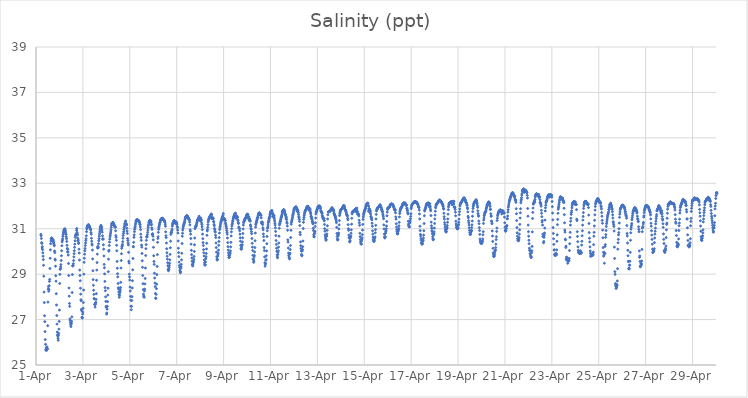
| Category | Salinity (ppt) |
|---|---|
| 44287.208333333336 | 30.75 |
| 44287.21875 | 30.69 |
| 44287.229166666664 | 30.57 |
| 44287.239583333336 | 30.39 |
| 44287.25 | 30.35 |
| 44287.260416666664 | 30.15 |
| 44287.270833333336 | 30.21 |
| 44287.28125 | 30.08 |
| 44287.291666666664 | 29.94 |
| 44287.302083333336 | 29.79 |
| 44287.3125 | 29.64 |
| 44287.322916666664 | 29.39 |
| 44287.333333333336 | 28.91 |
| 44287.34375 | 28.21 |
| 44287.354166666664 | 27.75 |
| 44287.364583333336 | 27.17 |
| 44287.375 | 26.91 |
| 44287.385416666664 | 26.47 |
| 44287.395833333336 | 26.12 |
| 44287.40625 | 25.91 |
| 44287.416666666664 | 25.66 |
| 44287.427083333336 | 25.69 |
| 44287.4375 | 25.76 |
| 44287.447916666664 | 25.64 |
| 44287.458333333336 | 25.72 |
| 44287.46875 | 25.8 |
| 44287.479166666664 | 25.7 |
| 44287.489583333336 | 25.71 |
| 44287.5 | 26.73 |
| 44287.510416666664 | 27.77 |
| 44287.520833333336 | 28.34 |
| 44287.53125 | 28.45 |
| 44287.541666666664 | 28.25 |
| 44287.552083333336 | 28.33 |
| 44287.5625 | 28.49 |
| 44287.572916666664 | 28.68 |
| 44287.583333333336 | 28.77 |
| 44287.59375 | 29.25 |
| 44287.604166666664 | 29.7 |
| 44287.614583333336 | 30.07 |
| 44287.625 | 30.34 |
| 44287.635416666664 | 30.46 |
| 44287.645833333336 | 30.55 |
| 44287.65625 | 30.58 |
| 44287.666666666664 | 30.59 |
| 44287.677083333336 | 30.58 |
| 44287.6875 | 30.56 |
| 44287.697916666664 | 30.54 |
| 44287.708333333336 | 30.44 |
| 44287.71875 | 30.51 |
| 44287.729166666664 | 30.51 |
| 44287.739583333336 | 30.46 |
| 44287.75 | 30.42 |
| 44287.760416666664 | 30.36 |
| 44287.770833333336 | 30.29 |
| 44287.78125 | 30.25 |
| 44287.791666666664 | 30.02 |
| 44287.802083333336 | 29.95 |
| 44287.8125 | 29.66 |
| 44287.822916666664 | 29.62 |
| 44287.833333333336 | 29.35 |
| 44287.84375 | 28.93 |
| 44287.854166666664 | 28.69 |
| 44287.864583333336 | 28.14 |
| 44287.875 | 27.64 |
| 44287.885416666664 | 27.18 |
| 44287.895833333336 | 26.8 |
| 44287.90625 | 26.45 |
| 44287.916666666664 | 26.32 |
| 44287.927083333336 | 26.28 |
| 44287.9375 | 26.18 |
| 44287.947916666664 | 26.09 |
| 44287.958333333336 | 26.3 |
| 44287.96875 | 26.39 |
| 44287.979166666664 | 26.58 |
| 44287.989583333336 | 26.92 |
| 44288.0 | 27.42 |
| 44288.010416666664 | 28.59 |
| 44288.020833333336 | 28.99 |
| 44288.03125 | 29.21 |
| 44288.041666666664 | 29.24 |
| 44288.052083333336 | 29.32 |
| 44288.0625 | 29.42 |
| 44288.072916666664 | 29.6 |
| 44288.083333333336 | 29.81 |
| 44288.09375 | 30.03 |
| 44288.104166666664 | 30.25 |
| 44288.114583333336 | 30.42 |
| 44288.125 | 30.49 |
| 44288.135416666664 | 30.55 |
| 44288.145833333336 | 30.66 |
| 44288.15625 | 30.73 |
| 44288.166666666664 | 30.81 |
| 44288.177083333336 | 30.86 |
| 44288.1875 | 30.92 |
| 44288.197916666664 | 30.94 |
| 44288.208333333336 | 30.97 |
| 44288.21875 | 30.97 |
| 44288.229166666664 | 31 |
| 44288.239583333336 | 30.9 |
| 44288.25 | 30.94 |
| 44288.260416666664 | 30.85 |
| 44288.270833333336 | 30.77 |
| 44288.28125 | 30.75 |
| 44288.291666666664 | 30.64 |
| 44288.302083333336 | 30.56 |
| 44288.3125 | 30.44 |
| 44288.322916666664 | 30.27 |
| 44288.333333333336 | 30.13 |
| 44288.34375 | 29.99 |
| 44288.354166666664 | 30.09 |
| 44288.364583333336 | 29.97 |
| 44288.375 | 29.84 |
| 44288.385416666664 | 29.47 |
| 44288.395833333336 | 28.94 |
| 44288.40625 | 28.39 |
| 44288.416666666664 | 28.03 |
| 44288.427083333336 | 27.71 |
| 44288.4375 | 27.58 |
| 44288.447916666664 | 27.03 |
| 44288.458333333336 | 26.96 |
| 44288.46875 | 26.87 |
| 44288.479166666664 | 26.77 |
| 44288.489583333336 | 26.69 |
| 44288.5 | 26.84 |
| 44288.510416666664 | 26.82 |
| 44288.520833333336 | 26.92 |
| 44288.53125 | 27.12 |
| 44288.541666666664 | 28.19 |
| 44288.552083333336 | 28.98 |
| 44288.5625 | 29.36 |
| 44288.572916666664 | 29.38 |
| 44288.583333333336 | 29.37 |
| 44288.59375 | 29.46 |
| 44288.604166666664 | 29.6 |
| 44288.614583333336 | 29.76 |
| 44288.625 | 29.9 |
| 44288.635416666664 | 30.03 |
| 44288.645833333336 | 30.18 |
| 44288.65625 | 30.32 |
| 44288.666666666664 | 30.47 |
| 44288.677083333336 | 30.62 |
| 44288.6875 | 30.69 |
| 44288.697916666664 | 30.73 |
| 44288.708333333336 | 30.75 |
| 44288.71875 | 30.78 |
| 44288.729166666664 | 30.93 |
| 44288.739583333336 | 31.01 |
| 44288.75 | 30.84 |
| 44288.760416666664 | 30.79 |
| 44288.770833333336 | 30.72 |
| 44288.78125 | 30.58 |
| 44288.791666666664 | 30.46 |
| 44288.802083333336 | 30.5 |
| 44288.8125 | 30.35 |
| 44288.822916666664 | 30.37 |
| 44288.833333333336 | 30.1 |
| 44288.84375 | 29.93 |
| 44288.854166666664 | 29.62 |
| 44288.864583333336 | 29.18 |
| 44288.875 | 28.94 |
| 44288.885416666664 | 28.71 |
| 44288.895833333336 | 28.38 |
| 44288.90625 | 28.12 |
| 44288.916666666664 | 27.87 |
| 44288.927083333336 | 27.83 |
| 44288.9375 | 27.45 |
| 44288.947916666664 | 27.39 |
| 44288.958333333336 | 27.1 |
| 44288.96875 | 27.07 |
| 44288.979166666664 | 27.08 |
| 44288.989583333336 | 27.24 |
| 44289.0 | 27.33 |
| 44289.010416666664 | 27.5 |
| 44289.020833333336 | 27.75 |
| 44289.03125 | 28.3 |
| 44289.041666666664 | 29 |
| 44289.052083333336 | 29.52 |
| 44289.0625 | 29.7 |
| 44289.072916666664 | 29.88 |
| 44289.083333333336 | 30.03 |
| 44289.09375 | 30.13 |
| 44289.104166666664 | 30.26 |
| 44289.114583333336 | 30.37 |
| 44289.125 | 30.48 |
| 44289.135416666664 | 30.56 |
| 44289.145833333336 | 30.69 |
| 44289.15625 | 30.87 |
| 44289.166666666664 | 30.99 |
| 44289.177083333336 | 31.05 |
| 44289.1875 | 31.1 |
| 44289.197916666664 | 31.13 |
| 44289.208333333336 | 31.15 |
| 44289.21875 | 31.15 |
| 44289.229166666664 | 31.17 |
| 44289.239583333336 | 31.18 |
| 44289.25 | 31.15 |
| 44289.260416666664 | 31.08 |
| 44289.270833333336 | 31.13 |
| 44289.28125 | 31.1 |
| 44289.291666666664 | 31.07 |
| 44289.302083333336 | 31.03 |
| 44289.3125 | 30.98 |
| 44289.322916666664 | 31 |
| 44289.333333333336 | 30.95 |
| 44289.34375 | 30.83 |
| 44289.354166666664 | 30.76 |
| 44289.364583333336 | 30.58 |
| 44289.375 | 30.45 |
| 44289.385416666664 | 30.33 |
| 44289.395833333336 | 30.28 |
| 44289.40625 | 30.06 |
| 44289.416666666664 | 29.67 |
| 44289.427083333336 | 29.15 |
| 44289.4375 | 28.76 |
| 44289.447916666664 | 28.51 |
| 44289.458333333336 | 28.29 |
| 44289.46875 | 28.11 |
| 44289.479166666664 | 27.93 |
| 44289.489583333336 | 27.91 |
| 44289.5 | 27.67 |
| 44289.510416666664 | 27.67 |
| 44289.520833333336 | 27.55 |
| 44289.53125 | 27.67 |
| 44289.541666666664 | 27.73 |
| 44289.552083333336 | 27.76 |
| 44289.5625 | 27.89 |
| 44289.572916666664 | 28.14 |
| 44289.583333333336 | 28.73 |
| 44289.59375 | 29.18 |
| 44289.604166666664 | 29.51 |
| 44289.614583333336 | 29.88 |
| 44289.625 | 30.16 |
| 44289.635416666664 | 30.22 |
| 44289.645833333336 | 30.15 |
| 44289.65625 | 30.19 |
| 44289.666666666664 | 30.34 |
| 44289.677083333336 | 30.47 |
| 44289.6875 | 30.56 |
| 44289.697916666664 | 30.67 |
| 44289.708333333336 | 30.77 |
| 44289.71875 | 30.86 |
| 44289.729166666664 | 30.95 |
| 44289.739583333336 | 31.04 |
| 44289.75 | 31.08 |
| 44289.760416666664 | 31.09 |
| 44289.770833333336 | 31.15 |
| 44289.78125 | 31.05 |
| 44289.791666666664 | 31.04 |
| 44289.802083333336 | 31.08 |
| 44289.8125 | 30.95 |
| 44289.822916666664 | 30.85 |
| 44289.833333333336 | 30.69 |
| 44289.84375 | 30.54 |
| 44289.854166666664 | 30.56 |
| 44289.864583333336 | 30.54 |
| 44289.875 | 30.29 |
| 44289.885416666664 | 30.1 |
| 44289.895833333336 | 29.8 |
| 44289.90625 | 29.43 |
| 44289.916666666664 | 29.28 |
| 44289.927083333336 | 29.01 |
| 44289.9375 | 28.68 |
| 44289.947916666664 | 28.41 |
| 44289.958333333336 | 28.27 |
| 44289.96875 | 28 |
| 44289.979166666664 | 27.8 |
| 44289.989583333336 | 27.58 |
| 44290.0 | 27.54 |
| 44290.010416666664 | 27.24 |
| 44290.020833333336 | 27.29 |
| 44290.03125 | 27.46 |
| 44290.041666666664 | 27.58 |
| 44290.052083333336 | 27.79 |
| 44290.0625 | 28.08 |
| 44290.072916666664 | 28.38 |
| 44290.083333333336 | 29.11 |
| 44290.09375 | 29.66 |
| 44290.104166666664 | 30.01 |
| 44290.114583333336 | 30.05 |
| 44290.125 | 30.26 |
| 44290.135416666664 | 30.41 |
| 44290.145833333336 | 30.54 |
| 44290.15625 | 30.64 |
| 44290.166666666664 | 30.71 |
| 44290.177083333336 | 30.79 |
| 44290.1875 | 30.86 |
| 44290.197916666664 | 30.95 |
| 44290.208333333336 | 31.06 |
| 44290.21875 | 31.15 |
| 44290.229166666664 | 31.21 |
| 44290.239583333336 | 31.24 |
| 44290.25 | 31.25 |
| 44290.260416666664 | 31.26 |
| 44290.270833333336 | 31.26 |
| 44290.28125 | 31.27 |
| 44290.291666666664 | 31.27 |
| 44290.302083333336 | 31.21 |
| 44290.3125 | 31.19 |
| 44290.322916666664 | 31.18 |
| 44290.333333333336 | 31.16 |
| 44290.34375 | 31.11 |
| 44290.354166666664 | 31.1 |
| 44290.364583333336 | 31.08 |
| 44290.375 | 31.09 |
| 44290.385416666664 | 31.06 |
| 44290.395833333336 | 30.91 |
| 44290.40625 | 30.7 |
| 44290.416666666664 | 30.62 |
| 44290.427083333336 | 30.49 |
| 44290.4375 | 30.27 |
| 44290.447916666664 | 30.03 |
| 44290.458333333336 | 29.56 |
| 44290.46875 | 29.26 |
| 44290.479166666664 | 29.02 |
| 44290.489583333336 | 28.88 |
| 44290.5 | 28.59 |
| 44290.510416666664 | 28.4 |
| 44290.520833333336 | 28.35 |
| 44290.53125 | 28.22 |
| 44290.541666666664 | 28.1 |
| 44290.552083333336 | 27.98 |
| 44290.5625 | 28.06 |
| 44290.572916666664 | 28.18 |
| 44290.583333333336 | 28.24 |
| 44290.59375 | 28.31 |
| 44290.604166666664 | 28.41 |
| 44290.614583333336 | 28.64 |
| 44290.625 | 29.27 |
| 44290.635416666664 | 29.6 |
| 44290.645833333336 | 29.9 |
| 44290.65625 | 30.14 |
| 44290.666666666664 | 30.22 |
| 44290.677083333336 | 30.25 |
| 44290.6875 | 30.31 |
| 44290.697916666664 | 30.43 |
| 44290.708333333336 | 30.58 |
| 44290.71875 | 30.7 |
| 44290.729166666664 | 30.79 |
| 44290.739583333336 | 30.87 |
| 44290.75 | 30.96 |
| 44290.760416666664 | 31.05 |
| 44290.770833333336 | 31.09 |
| 44290.78125 | 31.16 |
| 44290.791666666664 | 31.22 |
| 44290.802083333336 | 31.24 |
| 44290.8125 | 31.31 |
| 44290.822916666664 | 31.34 |
| 44290.833333333336 | 31.22 |
| 44290.84375 | 31.2 |
| 44290.854166666664 | 31.2 |
| 44290.864583333336 | 31.16 |
| 44290.875 | 31.02 |
| 44290.885416666664 | 30.9 |
| 44290.895833333336 | 30.79 |
| 44290.90625 | 30.57 |
| 44290.916666666664 | 30.48 |
| 44290.927083333336 | 30.37 |
| 44290.9375 | 30.29 |
| 44290.947916666664 | 29.96 |
| 44290.958333333336 | 29.57 |
| 44290.96875 | 29.49 |
| 44290.979166666664 | 29 |
| 44290.989583333336 | 28.88 |
| 44291.0 | 28.74 |
| 44291.010416666664 | 28.43 |
| 44291.020833333336 | 28.26 |
| 44291.03125 | 28.02 |
| 44291.041666666664 | 27.85 |
| 44291.052083333336 | 27.59 |
| 44291.0625 | 27.43 |
| 44291.072916666664 | 27.58 |
| 44291.083333333336 | 27.84 |
| 44291.09375 | 28.01 |
| 44291.104166666664 | 28.39 |
| 44291.114583333336 | 28.71 |
| 44291.125 | 29.19 |
| 44291.135416666664 | 29.69 |
| 44291.145833333336 | 30.21 |
| 44291.15625 | 30.21 |
| 44291.166666666664 | 30.4 |
| 44291.177083333336 | 30.62 |
| 44291.1875 | 30.73 |
| 44291.197916666664 | 30.87 |
| 44291.208333333336 | 30.97 |
| 44291.21875 | 31.04 |
| 44291.229166666664 | 31.09 |
| 44291.239583333336 | 31.17 |
| 44291.25 | 31.24 |
| 44291.260416666664 | 31.3 |
| 44291.270833333336 | 31.35 |
| 44291.28125 | 31.37 |
| 44291.291666666664 | 31.38 |
| 44291.302083333336 | 31.39 |
| 44291.3125 | 31.39 |
| 44291.322916666664 | 31.4 |
| 44291.333333333336 | 31.37 |
| 44291.34375 | 31.35 |
| 44291.354166666664 | 31.34 |
| 44291.364583333336 | 31.37 |
| 44291.375 | 31.35 |
| 44291.385416666664 | 31.34 |
| 44291.395833333336 | 31.32 |
| 44291.40625 | 31.3 |
| 44291.416666666664 | 31.26 |
| 44291.427083333336 | 31.2 |
| 44291.4375 | 31.18 |
| 44291.447916666664 | 31.08 |
| 44291.458333333336 | 30.96 |
| 44291.46875 | 30.76 |
| 44291.479166666664 | 30.62 |
| 44291.489583333336 | 30.49 |
| 44291.5 | 30.28 |
| 44291.510416666664 | 30.19 |
| 44291.520833333336 | 29.91 |
| 44291.53125 | 29.59 |
| 44291.541666666664 | 29.3 |
| 44291.552083333336 | 28.94 |
| 44291.5625 | 28.58 |
| 44291.572916666664 | 28.32 |
| 44291.583333333336 | 28.12 |
| 44291.59375 | 28.04 |
| 44291.604166666664 | 27.99 |
| 44291.614583333336 | 27.99 |
| 44291.625 | 28.26 |
| 44291.635416666664 | 28.34 |
| 44291.645833333336 | 28.57 |
| 44291.65625 | 28.81 |
| 44291.666666666664 | 29.27 |
| 44291.677083333336 | 29.82 |
| 44291.6875 | 30.12 |
| 44291.697916666664 | 30.3 |
| 44291.708333333336 | 30.49 |
| 44291.71875 | 30.64 |
| 44291.729166666664 | 30.63 |
| 44291.739583333336 | 30.66 |
| 44291.75 | 30.74 |
| 44291.760416666664 | 30.84 |
| 44291.770833333336 | 30.94 |
| 44291.78125 | 31.05 |
| 44291.791666666664 | 31.13 |
| 44291.802083333336 | 31.19 |
| 44291.8125 | 31.26 |
| 44291.822916666664 | 31.29 |
| 44291.833333333336 | 31.32 |
| 44291.84375 | 31.32 |
| 44291.854166666664 | 31.37 |
| 44291.864583333336 | 31.37 |
| 44291.875 | 31.36 |
| 44291.885416666664 | 31.3 |
| 44291.895833333336 | 31.3 |
| 44291.90625 | 31.31 |
| 44291.916666666664 | 31.17 |
| 44291.927083333336 | 31.2 |
| 44291.9375 | 31.04 |
| 44291.947916666664 | 30.97 |
| 44291.958333333336 | 30.74 |
| 44291.96875 | 30.78 |
| 44291.979166666664 | 30.77 |
| 44291.989583333336 | 30.67 |
| 44292.0 | 30.51 |
| 44292.010416666664 | 30.18 |
| 44292.020833333336 | 29.81 |
| 44292.03125 | 29.56 |
| 44292.041666666664 | 29.43 |
| 44292.052083333336 | 29.04 |
| 44292.0625 | 28.83 |
| 44292.072916666664 | 28.61 |
| 44292.083333333336 | 28.45 |
| 44292.09375 | 28.15 |
| 44292.104166666664 | 27.95 |
| 44292.114583333336 | 27.93 |
| 44292.125 | 28.11 |
| 44292.135416666664 | 28.36 |
| 44292.145833333336 | 28.56 |
| 44292.15625 | 28.98 |
| 44292.166666666664 | 29.34 |
| 44292.177083333336 | 29.86 |
| 44292.1875 | 30.4 |
| 44292.197916666664 | 30.57 |
| 44292.208333333336 | 30.65 |
| 44292.21875 | 30.84 |
| 44292.229166666664 | 30.97 |
| 44292.239583333336 | 31.05 |
| 44292.25 | 31.11 |
| 44292.260416666664 | 31.16 |
| 44292.270833333336 | 31.21 |
| 44292.28125 | 31.26 |
| 44292.291666666664 | 31.29 |
| 44292.302083333336 | 31.34 |
| 44292.3125 | 31.37 |
| 44292.322916666664 | 31.4 |
| 44292.333333333336 | 31.42 |
| 44292.34375 | 31.44 |
| 44292.354166666664 | 31.44 |
| 44292.364583333336 | 31.45 |
| 44292.375 | 31.46 |
| 44292.385416666664 | 31.46 |
| 44292.395833333336 | 31.46 |
| 44292.40625 | 31.44 |
| 44292.416666666664 | 31.4 |
| 44292.427083333336 | 31.41 |
| 44292.4375 | 31.4 |
| 44292.447916666664 | 31.37 |
| 44292.458333333336 | 31.38 |
| 44292.46875 | 31.37 |
| 44292.479166666664 | 31.32 |
| 44292.489583333336 | 31.34 |
| 44292.5 | 31.28 |
| 44292.510416666664 | 31.2 |
| 44292.520833333336 | 31.11 |
| 44292.53125 | 30.86 |
| 44292.541666666664 | 30.69 |
| 44292.552083333336 | 30.61 |
| 44292.5625 | 30.37 |
| 44292.572916666664 | 30.12 |
| 44292.583333333336 | 29.94 |
| 44292.59375 | 29.79 |
| 44292.604166666664 | 29.66 |
| 44292.614583333336 | 29.5 |
| 44292.625 | 29.37 |
| 44292.635416666664 | 29.21 |
| 44292.645833333336 | 29.15 |
| 44292.65625 | 29.18 |
| 44292.666666666664 | 29.2 |
| 44292.677083333336 | 29.29 |
| 44292.6875 | 29.38 |
| 44292.697916666664 | 29.48 |
| 44292.708333333336 | 29.63 |
| 44292.71875 | 29.87 |
| 44292.729166666664 | 30.16 |
| 44292.739583333336 | 30.45 |
| 44292.75 | 30.75 |
| 44292.760416666664 | 30.84 |
| 44292.770833333336 | 30.83 |
| 44292.78125 | 30.83 |
| 44292.791666666664 | 30.91 |
| 44292.802083333336 | 30.98 |
| 44292.8125 | 31.11 |
| 44292.822916666664 | 31.18 |
| 44292.833333333336 | 31.23 |
| 44292.84375 | 31.27 |
| 44292.854166666664 | 31.29 |
| 44292.864583333336 | 31.31 |
| 44292.875 | 31.33 |
| 44292.885416666664 | 31.35 |
| 44292.895833333336 | 31.36 |
| 44292.90625 | 31.35 |
| 44292.916666666664 | 31.31 |
| 44292.927083333336 | 31.3 |
| 44292.9375 | 31.24 |
| 44292.947916666664 | 31.25 |
| 44292.958333333336 | 31.23 |
| 44292.96875 | 31.31 |
| 44292.979166666664 | 31.24 |
| 44292.989583333336 | 31.27 |
| 44293.0 | 31.26 |
| 44293.010416666664 | 31.2 |
| 44293.020833333336 | 31.1 |
| 44293.03125 | 31.05 |
| 44293.041666666664 | 30.94 |
| 44293.052083333336 | 30.81 |
| 44293.0625 | 30.46 |
| 44293.072916666664 | 30.14 |
| 44293.083333333336 | 29.95 |
| 44293.09375 | 29.77 |
| 44293.104166666664 | 29.53 |
| 44293.114583333336 | 29.38 |
| 44293.125 | 29.3 |
| 44293.135416666664 | 29.18 |
| 44293.145833333336 | 29.13 |
| 44293.15625 | 29.06 |
| 44293.166666666664 | 29.1 |
| 44293.177083333336 | 29.26 |
| 44293.1875 | 29.32 |
| 44293.197916666664 | 29.43 |
| 44293.208333333336 | 29.63 |
| 44293.21875 | 29.92 |
| 44293.229166666664 | 30.35 |
| 44293.239583333336 | 30.67 |
| 44293.25 | 30.8 |
| 44293.260416666664 | 30.94 |
| 44293.270833333336 | 31.02 |
| 44293.28125 | 31.09 |
| 44293.291666666664 | 31.14 |
| 44293.302083333336 | 31.18 |
| 44293.3125 | 31.22 |
| 44293.322916666664 | 31.25 |
| 44293.333333333336 | 31.29 |
| 44293.34375 | 31.34 |
| 44293.354166666664 | 31.39 |
| 44293.364583333336 | 31.45 |
| 44293.375 | 31.49 |
| 44293.385416666664 | 31.52 |
| 44293.395833333336 | 31.54 |
| 44293.40625 | 31.55 |
| 44293.416666666664 | 31.56 |
| 44293.427083333336 | 31.57 |
| 44293.4375 | 31.57 |
| 44293.447916666664 | 31.57 |
| 44293.458333333336 | 31.53 |
| 44293.46875 | 31.53 |
| 44293.479166666664 | 31.48 |
| 44293.489583333336 | 31.49 |
| 44293.5 | 31.49 |
| 44293.510416666664 | 31.45 |
| 44293.520833333336 | 31.4 |
| 44293.53125 | 31.41 |
| 44293.541666666664 | 31.38 |
| 44293.552083333336 | 31.29 |
| 44293.5625 | 31.17 |
| 44293.572916666664 | 30.95 |
| 44293.583333333336 | 30.89 |
| 44293.59375 | 30.76 |
| 44293.604166666664 | 30.57 |
| 44293.614583333336 | 30.32 |
| 44293.625 | 30.05 |
| 44293.635416666664 | 29.86 |
| 44293.645833333336 | 29.71 |
| 44293.65625 | 29.57 |
| 44293.666666666664 | 29.43 |
| 44293.677083333336 | 29.38 |
| 44293.6875 | 29.36 |
| 44293.697916666664 | 29.45 |
| 44293.708333333336 | 29.52 |
| 44293.71875 | 29.58 |
| 44293.729166666664 | 29.66 |
| 44293.739583333336 | 29.78 |
| 44293.75 | 30 |
| 44293.760416666664 | 30.29 |
| 44293.770833333336 | 30.59 |
| 44293.78125 | 31 |
| 44293.791666666664 | 31.08 |
| 44293.802083333336 | 31.1 |
| 44293.8125 | 31.09 |
| 44293.822916666664 | 31.1 |
| 44293.833333333336 | 31.14 |
| 44293.84375 | 31.18 |
| 44293.854166666664 | 31.24 |
| 44293.864583333336 | 31.28 |
| 44293.875 | 31.33 |
| 44293.885416666664 | 31.37 |
| 44293.895833333336 | 31.4 |
| 44293.90625 | 31.41 |
| 44293.916666666664 | 31.43 |
| 44293.927083333336 | 31.46 |
| 44293.9375 | 31.47 |
| 44293.947916666664 | 31.49 |
| 44293.958333333336 | 31.55 |
| 44293.96875 | 31.48 |
| 44293.979166666664 | 31.43 |
| 44293.989583333336 | 31.37 |
| 44294.0 | 31.39 |
| 44294.010416666664 | 31.36 |
| 44294.020833333336 | 31.43 |
| 44294.03125 | 31.47 |
| 44294.041666666664 | 31.4 |
| 44294.052083333336 | 31.37 |
| 44294.0625 | 31.26 |
| 44294.072916666664 | 31.18 |
| 44294.083333333336 | 31.08 |
| 44294.09375 | 30.96 |
| 44294.104166666664 | 30.76 |
| 44294.114583333336 | 30.56 |
| 44294.125 | 30.39 |
| 44294.135416666664 | 30.26 |
| 44294.145833333336 | 30.08 |
| 44294.15625 | 29.94 |
| 44294.166666666664 | 29.8 |
| 44294.177083333336 | 29.62 |
| 44294.1875 | 29.5 |
| 44294.197916666664 | 29.41 |
| 44294.208333333336 | 29.4 |
| 44294.21875 | 29.41 |
| 44294.229166666664 | 29.54 |
| 44294.239583333336 | 29.68 |
| 44294.25 | 29.77 |
| 44294.260416666664 | 29.91 |
| 44294.270833333336 | 30.11 |
| 44294.28125 | 30.36 |
| 44294.291666666664 | 30.71 |
| 44294.302083333336 | 30.9 |
| 44294.3125 | 30.96 |
| 44294.322916666664 | 31.06 |
| 44294.333333333336 | 31.18 |
| 44294.34375 | 31.3 |
| 44294.354166666664 | 31.36 |
| 44294.364583333336 | 31.41 |
| 44294.375 | 31.44 |
| 44294.385416666664 | 31.47 |
| 44294.395833333336 | 31.48 |
| 44294.40625 | 31.52 |
| 44294.416666666664 | 31.53 |
| 44294.427083333336 | 31.56 |
| 44294.4375 | 31.57 |
| 44294.447916666664 | 31.59 |
| 44294.458333333336 | 31.59 |
| 44294.46875 | 31.61 |
| 44294.479166666664 | 31.65 |
| 44294.489583333336 | 31.62 |
| 44294.5 | 31.45 |
| 44294.510416666664 | 31.44 |
| 44294.520833333336 | 31.45 |
| 44294.53125 | 31.49 |
| 44294.541666666664 | 31.48 |
| 44294.552083333336 | 31.44 |
| 44294.5625 | 31.45 |
| 44294.572916666664 | 31.32 |
| 44294.583333333336 | 31.3 |
| 44294.59375 | 31.19 |
| 44294.604166666664 | 31.13 |
| 44294.614583333336 | 31.01 |
| 44294.625 | 30.95 |
| 44294.635416666664 | 30.89 |
| 44294.645833333336 | 30.85 |
| 44294.65625 | 30.71 |
| 44294.666666666664 | 30.61 |
| 44294.677083333336 | 30.37 |
| 44294.6875 | 30.17 |
| 44294.697916666664 | 29.97 |
| 44294.708333333336 | 29.76 |
| 44294.71875 | 29.65 |
| 44294.729166666664 | 29.62 |
| 44294.739583333336 | 29.65 |
| 44294.75 | 29.79 |
| 44294.760416666664 | 29.85 |
| 44294.770833333336 | 29.93 |
| 44294.78125 | 30.06 |
| 44294.791666666664 | 30.27 |
| 44294.802083333336 | 30.44 |
| 44294.8125 | 30.61 |
| 44294.822916666664 | 30.81 |
| 44294.833333333336 | 30.96 |
| 44294.84375 | 31.04 |
| 44294.854166666664 | 31.11 |
| 44294.864583333336 | 31.17 |
| 44294.875 | 31.24 |
| 44294.885416666664 | 31.29 |
| 44294.895833333336 | 31.32 |
| 44294.90625 | 31.36 |
| 44294.916666666664 | 31.41 |
| 44294.927083333336 | 31.45 |
| 44294.9375 | 31.47 |
| 44294.947916666664 | 31.52 |
| 44294.958333333336 | 31.53 |
| 44294.96875 | 31.56 |
| 44294.979166666664 | 31.6 |
| 44294.989583333336 | 31.67 |
| 44295.0 | 31.46 |
| 44295.010416666664 | 31.4 |
| 44295.020833333336 | 31.41 |
| 44295.03125 | 31.42 |
| 44295.041666666664 | 31.44 |
| 44295.052083333336 | 31.42 |
| 44295.0625 | 31.36 |
| 44295.072916666664 | 31.36 |
| 44295.083333333336 | 31.25 |
| 44295.09375 | 31.2 |
| 44295.104166666664 | 31.12 |
| 44295.114583333336 | 31.09 |
| 44295.125 | 31.01 |
| 44295.135416666664 | 30.92 |
| 44295.145833333336 | 30.84 |
| 44295.15625 | 30.76 |
| 44295.166666666664 | 30.59 |
| 44295.177083333336 | 30.39 |
| 44295.1875 | 30.21 |
| 44295.197916666664 | 30.06 |
| 44295.208333333336 | 29.94 |
| 44295.21875 | 29.83 |
| 44295.229166666664 | 29.73 |
| 44295.239583333336 | 29.74 |
| 44295.25 | 29.75 |
| 44295.260416666664 | 29.84 |
| 44295.270833333336 | 29.89 |
| 44295.28125 | 29.93 |
| 44295.291666666664 | 30.02 |
| 44295.302083333336 | 30.2 |
| 44295.3125 | 30.4 |
| 44295.322916666664 | 30.68 |
| 44295.333333333336 | 30.86 |
| 44295.34375 | 31 |
| 44295.354166666664 | 31.12 |
| 44295.364583333336 | 31.18 |
| 44295.375 | 31.24 |
| 44295.385416666664 | 31.31 |
| 44295.395833333336 | 31.37 |
| 44295.40625 | 31.43 |
| 44295.416666666664 | 31.47 |
| 44295.427083333336 | 31.51 |
| 44295.4375 | 31.53 |
| 44295.447916666664 | 31.57 |
| 44295.458333333336 | 31.61 |
| 44295.46875 | 31.64 |
| 44295.479166666664 | 31.65 |
| 44295.489583333336 | 31.57 |
| 44295.5 | 31.62 |
| 44295.510416666664 | 31.69 |
| 44295.520833333336 | 31.55 |
| 44295.53125 | 31.46 |
| 44295.541666666664 | 31.48 |
| 44295.552083333336 | 31.54 |
| 44295.5625 | 31.56 |
| 44295.572916666664 | 31.54 |
| 44295.583333333336 | 31.51 |
| 44295.59375 | 31.5 |
| 44295.604166666664 | 31.39 |
| 44295.614583333336 | 31.36 |
| 44295.625 | 31.27 |
| 44295.635416666664 | 31.23 |
| 44295.645833333336 | 31.08 |
| 44295.65625 | 31.03 |
| 44295.666666666664 | 31.03 |
| 44295.677083333336 | 31 |
| 44295.6875 | 30.91 |
| 44295.697916666664 | 30.76 |
| 44295.708333333336 | 30.6 |
| 44295.71875 | 30.45 |
| 44295.729166666664 | 30.27 |
| 44295.739583333336 | 30.14 |
| 44295.75 | 30.1 |
| 44295.760416666664 | 30.1 |
| 44295.770833333336 | 30.19 |
| 44295.78125 | 30.27 |
| 44295.791666666664 | 30.3 |
| 44295.802083333336 | 30.42 |
| 44295.8125 | 30.6 |
| 44295.822916666664 | 30.79 |
| 44295.833333333336 | 30.99 |
| 44295.84375 | 31.16 |
| 44295.854166666664 | 31.26 |
| 44295.864583333336 | 31.31 |
| 44295.875 | 31.33 |
| 44295.885416666664 | 31.36 |
| 44295.895833333336 | 31.39 |
| 44295.90625 | 31.4 |
| 44295.916666666664 | 31.44 |
| 44295.927083333336 | 31.45 |
| 44295.9375 | 31.47 |
| 44295.947916666664 | 31.49 |
| 44295.958333333336 | 31.51 |
| 44295.96875 | 31.55 |
| 44295.979166666664 | 31.57 |
| 44295.989583333336 | 31.61 |
| 44296.0 | 31.63 |
| 44296.010416666664 | 31.64 |
| 44296.020833333336 | 31.63 |
| 44296.03125 | 31.63 |
| 44296.041666666664 | 31.54 |
| 44296.052083333336 | 31.46 |
| 44296.0625 | 31.54 |
| 44296.072916666664 | 31.44 |
| 44296.083333333336 | 31.51 |
| 44296.09375 | 31.38 |
| 44296.104166666664 | 31.37 |
| 44296.114583333336 | 31.42 |
| 44296.125 | 31.33 |
| 44296.135416666664 | 31.35 |
| 44296.145833333336 | 31.17 |
| 44296.15625 | 31.11 |
| 44296.166666666664 | 31.01 |
| 44296.177083333336 | 30.97 |
| 44296.1875 | 30.87 |
| 44296.197916666664 | 30.78 |
| 44296.208333333336 | 30.57 |
| 44296.21875 | 30.36 |
| 44296.229166666664 | 30.19 |
| 44296.239583333336 | 30.04 |
| 44296.25 | 29.83 |
| 44296.260416666664 | 29.67 |
| 44296.270833333336 | 29.64 |
| 44296.28125 | 29.52 |
| 44296.291666666664 | 29.57 |
| 44296.302083333336 | 29.76 |
| 44296.3125 | 29.82 |
| 44296.322916666664 | 29.98 |
| 44296.333333333336 | 30.17 |
| 44296.34375 | 30.47 |
| 44296.354166666664 | 30.81 |
| 44296.364583333336 | 31.07 |
| 44296.375 | 31.18 |
| 44296.385416666664 | 31.24 |
| 44296.395833333336 | 31.28 |
| 44296.40625 | 31.31 |
| 44296.416666666664 | 31.35 |
| 44296.427083333336 | 31.4 |
| 44296.4375 | 31.45 |
| 44296.447916666664 | 31.48 |
| 44296.458333333336 | 31.51 |
| 44296.46875 | 31.56 |
| 44296.479166666664 | 31.6 |
| 44296.489583333336 | 31.64 |
| 44296.5 | 31.67 |
| 44296.510416666664 | 31.69 |
| 44296.520833333336 | 31.7 |
| 44296.53125 | 31.69 |
| 44296.541666666664 | 31.67 |
| 44296.552083333336 | 31.64 |
| 44296.5625 | 31.62 |
| 44296.572916666664 | 31.61 |
| 44296.583333333336 | 31.62 |
| 44296.59375 | 31.59 |
| 44296.604166666664 | 31.48 |
| 44296.614583333336 | 31.29 |
| 44296.625 | 31.23 |
| 44296.635416666664 | 31.23 |
| 44296.645833333336 | 31.26 |
| 44296.65625 | 31.29 |
| 44296.666666666664 | 31.18 |
| 44296.677083333336 | 31.04 |
| 44296.6875 | 30.95 |
| 44296.697916666664 | 30.77 |
| 44296.708333333336 | 30.65 |
| 44296.71875 | 30.48 |
| 44296.729166666664 | 30.17 |
| 44296.739583333336 | 30.04 |
| 44296.75 | 29.76 |
| 44296.760416666664 | 29.5 |
| 44296.770833333336 | 29.35 |
| 44296.78125 | 29.44 |
| 44296.791666666664 | 29.47 |
| 44296.802083333336 | 29.61 |
| 44296.8125 | 29.64 |
| 44296.822916666664 | 29.81 |
| 44296.833333333336 | 30.02 |
| 44296.84375 | 30.34 |
| 44296.854166666664 | 30.66 |
| 44296.864583333336 | 30.91 |
| 44296.875 | 31.03 |
| 44296.885416666664 | 31.07 |
| 44296.895833333336 | 31.16 |
| 44296.90625 | 31.26 |
| 44296.916666666664 | 31.31 |
| 44296.927083333336 | 31.37 |
| 44296.9375 | 31.44 |
| 44296.947916666664 | 31.46 |
| 44296.958333333336 | 31.5 |
| 44296.96875 | 31.55 |
| 44296.979166666664 | 31.62 |
| 44296.989583333336 | 31.67 |
| 44297.0 | 31.71 |
| 44297.010416666664 | 31.75 |
| 44297.020833333336 | 31.76 |
| 44297.03125 | 31.78 |
| 44297.041666666664 | 31.77 |
| 44297.052083333336 | 31.78 |
| 44297.0625 | 31.8 |
| 44297.072916666664 | 31.73 |
| 44297.083333333336 | 31.65 |
| 44297.09375 | 31.53 |
| 44297.104166666664 | 31.66 |
| 44297.114583333336 | 31.59 |
| 44297.125 | 31.59 |
| 44297.135416666664 | 31.58 |
| 44297.145833333336 | 31.57 |
| 44297.15625 | 31.51 |
| 44297.166666666664 | 31.43 |
| 44297.177083333336 | 31.34 |
| 44297.1875 | 31.24 |
| 44297.197916666664 | 31.16 |
| 44297.208333333336 | 31.04 |
| 44297.21875 | 30.88 |
| 44297.229166666664 | 30.7 |
| 44297.239583333336 | 30.48 |
| 44297.25 | 30.31 |
| 44297.260416666664 | 30.14 |
| 44297.270833333336 | 30.01 |
| 44297.28125 | 29.85 |
| 44297.291666666664 | 29.76 |
| 44297.302083333336 | 29.72 |
| 44297.3125 | 29.86 |
| 44297.322916666664 | 29.96 |
| 44297.333333333336 | 30.03 |
| 44297.34375 | 30.19 |
| 44297.354166666664 | 30.37 |
| 44297.364583333336 | 30.67 |
| 44297.375 | 31.02 |
| 44297.385416666664 | 31.17 |
| 44297.395833333336 | 31.23 |
| 44297.40625 | 31.26 |
| 44297.416666666664 | 31.32 |
| 44297.427083333336 | 31.35 |
| 44297.4375 | 31.42 |
| 44297.447916666664 | 31.46 |
| 44297.458333333336 | 31.51 |
| 44297.46875 | 31.52 |
| 44297.479166666664 | 31.57 |
| 44297.489583333336 | 31.63 |
| 44297.5 | 31.7 |
| 44297.510416666664 | 31.75 |
| 44297.520833333336 | 31.78 |
| 44297.53125 | 31.8 |
| 44297.541666666664 | 31.82 |
| 44297.552083333336 | 31.82 |
| 44297.5625 | 31.83 |
| 44297.572916666664 | 31.84 |
| 44297.583333333336 | 31.77 |
| 44297.59375 | 31.79 |
| 44297.604166666664 | 31.73 |
| 44297.614583333336 | 31.67 |
| 44297.625 | 31.65 |
| 44297.635416666664 | 31.61 |
| 44297.645833333336 | 31.61 |
| 44297.65625 | 31.54 |
| 44297.666666666664 | 31.44 |
| 44297.677083333336 | 31.5 |
| 44297.6875 | 31.4 |
| 44297.697916666664 | 31.29 |
| 44297.708333333336 | 31.24 |
| 44297.71875 | 31.12 |
| 44297.729166666664 | 30.93 |
| 44297.739583333336 | 30.51 |
| 44297.75 | 30.41 |
| 44297.760416666664 | 30.15 |
| 44297.770833333336 | 29.93 |
| 44297.78125 | 29.83 |
| 44297.791666666664 | 29.75 |
| 44297.802083333336 | 29.73 |
| 44297.8125 | 29.67 |
| 44297.822916666664 | 29.89 |
| 44297.833333333336 | 29.92 |
| 44297.84375 | 30.08 |
| 44297.854166666664 | 30.26 |
| 44297.864583333336 | 30.61 |
| 44297.875 | 30.93 |
| 44297.885416666664 | 31.2 |
| 44297.895833333336 | 31.29 |
| 44297.90625 | 31.34 |
| 44297.916666666664 | 31.39 |
| 44297.927083333336 | 31.43 |
| 44297.9375 | 31.5 |
| 44297.947916666664 | 31.57 |
| 44297.958333333336 | 31.62 |
| 44297.96875 | 31.66 |
| 44297.979166666664 | 31.72 |
| 44297.989583333336 | 31.79 |
| 44298.0 | 31.84 |
| 44298.010416666664 | 31.87 |
| 44298.020833333336 | 31.89 |
| 44298.03125 | 31.9 |
| 44298.041666666664 | 31.93 |
| 44298.052083333336 | 31.93 |
| 44298.0625 | 31.94 |
| 44298.072916666664 | 31.95 |
| 44298.083333333336 | 31.96 |
| 44298.09375 | 31.96 |
| 44298.104166666664 | 31.92 |
| 44298.114583333336 | 31.9 |
| 44298.125 | 31.8 |
| 44298.135416666664 | 31.78 |
| 44298.145833333336 | 31.84 |
| 44298.15625 | 31.84 |
| 44298.166666666664 | 31.79 |
| 44298.177083333336 | 31.73 |
| 44298.1875 | 31.71 |
| 44298.197916666664 | 31.62 |
| 44298.208333333336 | 31.53 |
| 44298.21875 | 31.48 |
| 44298.229166666664 | 31.41 |
| 44298.239583333336 | 31.32 |
| 44298.25 | 31.14 |
| 44298.260416666664 | 30.84 |
| 44298.270833333336 | 30.74 |
| 44298.28125 | 30.42 |
| 44298.291666666664 | 30.25 |
| 44298.302083333336 | 30.13 |
| 44298.3125 | 30.02 |
| 44298.322916666664 | 29.87 |
| 44298.333333333336 | 29.81 |
| 44298.34375 | 29.83 |
| 44298.354166666664 | 30.02 |
| 44298.364583333336 | 30.08 |
| 44298.375 | 30.21 |
| 44298.385416666664 | 30.46 |
| 44298.395833333336 | 31.01 |
| 44298.40625 | 31.28 |
| 44298.416666666664 | 31.41 |
| 44298.427083333336 | 31.5 |
| 44298.4375 | 31.58 |
| 44298.447916666664 | 31.65 |
| 44298.458333333336 | 31.7 |
| 44298.46875 | 31.75 |
| 44298.479166666664 | 31.78 |
| 44298.489583333336 | 31.8 |
| 44298.5 | 31.82 |
| 44298.510416666664 | 31.83 |
| 44298.520833333336 | 31.86 |
| 44298.53125 | 31.9 |
| 44298.541666666664 | 31.93 |
| 44298.552083333336 | 31.95 |
| 44298.5625 | 31.97 |
| 44298.572916666664 | 31.97 |
| 44298.583333333336 | 31.98 |
| 44298.59375 | 31.99 |
| 44298.604166666664 | 31.97 |
| 44298.614583333336 | 31.93 |
| 44298.625 | 31.86 |
| 44298.635416666664 | 31.83 |
| 44298.645833333336 | 31.89 |
| 44298.65625 | 31.89 |
| 44298.666666666664 | 31.89 |
| 44298.677083333336 | 31.88 |
| 44298.6875 | 31.84 |
| 44298.697916666664 | 31.77 |
| 44298.708333333336 | 31.7 |
| 44298.71875 | 31.65 |
| 44298.729166666664 | 31.55 |
| 44298.739583333336 | 31.54 |
| 44298.75 | 31.48 |
| 44298.760416666664 | 31.43 |
| 44298.770833333336 | 31.42 |
| 44298.78125 | 31.31 |
| 44298.791666666664 | 31.33 |
| 44298.802083333336 | 31.25 |
| 44298.8125 | 31.21 |
| 44298.822916666664 | 31.02 |
| 44298.833333333336 | 30.92 |
| 44298.84375 | 30.73 |
| 44298.854166666664 | 30.64 |
| 44298.864583333336 | 30.65 |
| 44298.875 | 30.81 |
| 44298.885416666664 | 30.79 |
| 44298.895833333336 | 30.89 |
| 44298.90625 | 31.1 |
| 44298.916666666664 | 31.26 |
| 44298.927083333336 | 31.47 |
| 44298.9375 | 31.65 |
| 44298.947916666664 | 31.73 |
| 44298.958333333336 | 31.75 |
| 44298.96875 | 31.77 |
| 44298.979166666664 | 31.82 |
| 44298.989583333336 | 31.85 |
| 44299.0 | 31.88 |
| 44299.010416666664 | 31.91 |
| 44299.020833333336 | 31.96 |
| 44299.03125 | 31.96 |
| 44299.041666666664 | 31.97 |
| 44299.052083333336 | 31.99 |
| 44299.0625 | 32 |
| 44299.072916666664 | 31.92 |
| 44299.083333333336 | 32 |
| 44299.09375 | 31.99 |
| 44299.104166666664 | 31.98 |
| 44299.114583333336 | 31.97 |
| 44299.125 | 31.92 |
| 44299.135416666664 | 31.88 |
| 44299.145833333336 | 31.79 |
| 44299.15625 | 31.75 |
| 44299.166666666664 | 31.74 |
| 44299.177083333336 | 31.74 |
| 44299.1875 | 31.72 |
| 44299.197916666664 | 31.67 |
| 44299.208333333336 | 31.59 |
| 44299.21875 | 31.5 |
| 44299.229166666664 | 31.52 |
| 44299.239583333336 | 31.47 |
| 44299.25 | 31.48 |
| 44299.260416666664 | 31.42 |
| 44299.270833333336 | 31.43 |
| 44299.28125 | 31.44 |
| 44299.291666666664 | 31.35 |
| 44299.302083333336 | 31.19 |
| 44299.3125 | 31 |
| 44299.322916666664 | 30.89 |
| 44299.333333333336 | 30.73 |
| 44299.34375 | 30.64 |
| 44299.354166666664 | 30.56 |
| 44299.364583333336 | 30.49 |
| 44299.375 | 30.52 |
| 44299.385416666664 | 30.66 |
| 44299.395833333336 | 30.69 |
| 44299.40625 | 30.77 |
| 44299.416666666664 | 30.93 |
| 44299.427083333336 | 31.13 |
| 44299.4375 | 31.43 |
| 44299.447916666664 | 31.61 |
| 44299.458333333336 | 31.73 |
| 44299.46875 | 31.74 |
| 44299.479166666664 | 31.74 |
| 44299.489583333336 | 31.75 |
| 44299.5 | 31.76 |
| 44299.510416666664 | 31.76 |
| 44299.520833333336 | 31.77 |
| 44299.53125 | 31.77 |
| 44299.541666666664 | 31.78 |
| 44299.552083333336 | 31.79 |
| 44299.5625 | 31.81 |
| 44299.572916666664 | 31.84 |
| 44299.583333333336 | 31.86 |
| 44299.59375 | 31.88 |
| 44299.604166666664 | 31.88 |
| 44299.614583333336 | 31.88 |
| 44299.625 | 31.93 |
| 44299.635416666664 | 31.87 |
| 44299.645833333336 | 31.88 |
| 44299.65625 | 31.87 |
| 44299.666666666664 | 31.86 |
| 44299.677083333336 | 31.84 |
| 44299.6875 | 31.82 |
| 44299.697916666664 | 31.76 |
| 44299.708333333336 | 31.68 |
| 44299.71875 | 31.66 |
| 44299.729166666664 | 31.62 |
| 44299.739583333336 | 31.58 |
| 44299.75 | 31.57 |
| 44299.760416666664 | 31.52 |
| 44299.770833333336 | 31.52 |
| 44299.78125 | 31.44 |
| 44299.791666666664 | 31.42 |
| 44299.802083333336 | 31.34 |
| 44299.8125 | 31.27 |
| 44299.822916666664 | 31.06 |
| 44299.833333333336 | 30.79 |
| 44299.84375 | 30.66 |
| 44299.854166666664 | 30.56 |
| 44299.864583333336 | 30.5 |
| 44299.875 | 30.52 |
| 44299.885416666664 | 30.68 |
| 44299.895833333336 | 30.73 |
| 44299.90625 | 30.81 |
| 44299.916666666664 | 30.99 |
| 44299.927083333336 | 31.17 |
| 44299.9375 | 31.36 |
| 44299.947916666664 | 31.58 |
| 44299.958333333336 | 31.66 |
| 44299.96875 | 31.72 |
| 44299.979166666664 | 31.76 |
| 44299.989583333336 | 31.81 |
| 44300.0 | 31.83 |
| 44300.010416666664 | 31.85 |
| 44300.020833333336 | 31.86 |
| 44300.03125 | 31.86 |
| 44300.041666666664 | 31.87 |
| 44300.052083333336 | 31.88 |
| 44300.0625 | 31.9 |
| 44300.072916666664 | 31.92 |
| 44300.083333333336 | 31.94 |
| 44300.09375 | 31.98 |
| 44300.104166666664 | 31.98 |
| 44300.114583333336 | 32.02 |
| 44300.125 | 32.02 |
| 44300.135416666664 | 32.01 |
| 44300.145833333336 | 31.98 |
| 44300.15625 | 31.94 |
| 44300.166666666664 | 31.91 |
| 44300.177083333336 | 31.85 |
| 44300.1875 | 31.84 |
| 44300.197916666664 | 31.81 |
| 44300.208333333336 | 31.81 |
| 44300.21875 | 31.75 |
| 44300.229166666664 | 31.73 |
| 44300.239583333336 | 31.66 |
| 44300.25 | 31.62 |
| 44300.260416666664 | 31.6 |
| 44300.270833333336 | 31.59 |
| 44300.28125 | 31.56 |
| 44300.291666666664 | 31.46 |
| 44300.302083333336 | 31.39 |
| 44300.3125 | 31.18 |
| 44300.322916666664 | 31 |
| 44300.333333333336 | 30.93 |
| 44300.34375 | 30.72 |
| 44300.354166666664 | 30.62 |
| 44300.364583333336 | 30.58 |
| 44300.375 | 30.43 |
| 44300.385416666664 | 30.42 |
| 44300.395833333336 | 30.48 |
| 44300.40625 | 30.6 |
| 44300.416666666664 | 30.62 |
| 44300.427083333336 | 30.68 |
| 44300.4375 | 30.8 |
| 44300.447916666664 | 30.95 |
| 44300.458333333336 | 31.2 |
| 44300.46875 | 31.46 |
| 44300.479166666664 | 31.65 |
| 44300.489583333336 | 31.72 |
| 44300.5 | 31.73 |
| 44300.510416666664 | 31.75 |
| 44300.520833333336 | 31.78 |
| 44300.53125 | 31.74 |
| 44300.541666666664 | 31.77 |
| 44300.552083333336 | 31.78 |
| 44300.5625 | 31.79 |
| 44300.572916666664 | 31.79 |
| 44300.583333333336 | 31.8 |
| 44300.59375 | 31.82 |
| 44300.604166666664 | 31.83 |
| 44300.614583333336 | 31.86 |
| 44300.625 | 31.87 |
| 44300.635416666664 | 31.88 |
| 44300.645833333336 | 31.8 |
| 44300.65625 | 31.78 |
| 44300.666666666664 | 31.73 |
| 44300.677083333336 | 31.82 |
| 44300.6875 | 31.91 |
| 44300.697916666664 | 31.73 |
| 44300.708333333336 | 31.76 |
| 44300.71875 | 31.63 |
| 44300.729166666664 | 31.65 |
| 44300.739583333336 | 31.63 |
| 44300.75 | 31.64 |
| 44300.760416666664 | 31.63 |
| 44300.770833333336 | 31.56 |
| 44300.78125 | 31.37 |
| 44300.791666666664 | 31.26 |
| 44300.802083333336 | 31.15 |
| 44300.8125 | 30.8 |
| 44300.822916666664 | 30.65 |
| 44300.833333333336 | 30.52 |
| 44300.84375 | 30.42 |
| 44300.854166666664 | 30.35 |
| 44300.864583333336 | 30.32 |
| 44300.875 | 30.33 |
| 44300.885416666664 | 30.46 |
| 44300.895833333336 | 30.53 |
| 44300.90625 | 30.6 |
| 44300.916666666664 | 30.74 |
| 44300.927083333336 | 30.94 |
| 44300.9375 | 31.19 |
| 44300.947916666664 | 31.41 |
| 44300.958333333336 | 31.52 |
| 44300.96875 | 31.61 |
| 44300.979166666664 | 31.67 |
| 44300.989583333336 | 31.71 |
| 44301.0 | 31.75 |
| 44301.010416666664 | 31.78 |
| 44301.020833333336 | 31.82 |
| 44301.03125 | 31.84 |
| 44301.041666666664 | 31.87 |
| 44301.052083333336 | 31.9 |
| 44301.0625 | 31.96 |
| 44301.072916666664 | 32 |
| 44301.083333333336 | 32.03 |
| 44301.09375 | 32.06 |
| 44301.104166666664 | 32.08 |
| 44301.114583333336 | 32.09 |
| 44301.125 | 32.11 |
| 44301.135416666664 | 32.11 |
| 44301.145833333336 | 32.12 |
| 44301.15625 | 32.13 |
| 44301.166666666664 | 32.02 |
| 44301.177083333336 | 31.77 |
| 44301.1875 | 32 |
| 44301.197916666664 | 31.89 |
| 44301.208333333336 | 31.84 |
| 44301.21875 | 31.87 |
| 44301.229166666664 | 31.84 |
| 44301.239583333336 | 31.78 |
| 44301.25 | 31.7 |
| 44301.260416666664 | 31.78 |
| 44301.270833333336 | 31.65 |
| 44301.28125 | 31.54 |
| 44301.291666666664 | 31.52 |
| 44301.302083333336 | 31.48 |
| 44301.3125 | 31.43 |
| 44301.322916666664 | 31.39 |
| 44301.333333333336 | 31.24 |
| 44301.34375 | 31.11 |
| 44301.354166666664 | 30.91 |
| 44301.364583333336 | 30.76 |
| 44301.375 | 30.63 |
| 44301.385416666664 | 30.53 |
| 44301.395833333336 | 30.46 |
| 44301.40625 | 30.44 |
| 44301.416666666664 | 30.45 |
| 44301.427083333336 | 30.48 |
| 44301.4375 | 30.56 |
| 44301.447916666664 | 30.6 |
| 44301.458333333336 | 30.64 |
| 44301.46875 | 30.82 |
| 44301.479166666664 | 30.96 |
| 44301.489583333336 | 31.15 |
| 44301.5 | 31.43 |
| 44301.510416666664 | 31.63 |
| 44301.520833333336 | 31.78 |
| 44301.53125 | 31.85 |
| 44301.541666666664 | 31.85 |
| 44301.552083333336 | 31.87 |
| 44301.5625 | 31.89 |
| 44301.572916666664 | 31.92 |
| 44301.583333333336 | 31.94 |
| 44301.59375 | 31.95 |
| 44301.604166666664 | 31.96 |
| 44301.614583333336 | 31.97 |
| 44301.625 | 31.97 |
| 44301.635416666664 | 31.98 |
| 44301.645833333336 | 31.99 |
| 44301.65625 | 31.98 |
| 44301.666666666664 | 32.05 |
| 44301.677083333336 | 32.05 |
| 44301.6875 | 32 |
| 44301.697916666664 | 31.98 |
| 44301.708333333336 | 31.96 |
| 44301.71875 | 31.93 |
| 44301.729166666664 | 31.9 |
| 44301.739583333336 | 31.83 |
| 44301.75 | 31.82 |
| 44301.760416666664 | 31.82 |
| 44301.770833333336 | 31.75 |
| 44301.78125 | 31.75 |
| 44301.791666666664 | 31.65 |
| 44301.802083333336 | 31.6 |
| 44301.8125 | 31.53 |
| 44301.822916666664 | 31.44 |
| 44301.833333333336 | 31.17 |
| 44301.84375 | 30.99 |
| 44301.854166666664 | 30.76 |
| 44301.864583333336 | 30.64 |
| 44301.875 | 30.59 |
| 44301.885416666664 | 30.62 |
| 44301.895833333336 | 30.65 |
| 44301.90625 | 30.8 |
| 44301.916666666664 | 30.87 |
| 44301.927083333336 | 30.91 |
| 44301.9375 | 31 |
| 44301.947916666664 | 31.12 |
| 44301.958333333336 | 31.32 |
| 44301.96875 | 31.57 |
| 44301.979166666664 | 31.73 |
| 44301.989583333336 | 31.84 |
| 44302.0 | 31.89 |
| 44302.010416666664 | 31.92 |
| 44302.020833333336 | 31.92 |
| 44302.03125 | 31.93 |
| 44302.041666666664 | 31.93 |
| 44302.052083333336 | 31.93 |
| 44302.0625 | 31.94 |
| 44302.072916666664 | 31.96 |
| 44302.083333333336 | 31.97 |
| 44302.09375 | 32.01 |
| 44302.104166666664 | 32.04 |
| 44302.114583333336 | 32.06 |
| 44302.125 | 32.07 |
| 44302.135416666664 | 32.08 |
| 44302.145833333336 | 32.08 |
| 44302.15625 | 32.08 |
| 44302.166666666664 | 32.09 |
| 44302.177083333336 | 32.09 |
| 44302.1875 | 32.07 |
| 44302.197916666664 | 32.06 |
| 44302.208333333336 | 32.07 |
| 44302.21875 | 32.06 |
| 44302.229166666664 | 32.01 |
| 44302.239583333336 | 32 |
| 44302.25 | 31.97 |
| 44302.260416666664 | 31.94 |
| 44302.270833333336 | 31.91 |
| 44302.28125 | 31.86 |
| 44302.291666666664 | 31.84 |
| 44302.302083333336 | 31.84 |
| 44302.3125 | 31.8 |
| 44302.322916666664 | 31.83 |
| 44302.333333333336 | 31.7 |
| 44302.34375 | 31.52 |
| 44302.354166666664 | 31.42 |
| 44302.364583333336 | 31.22 |
| 44302.375 | 31.07 |
| 44302.385416666664 | 30.95 |
| 44302.395833333336 | 30.87 |
| 44302.40625 | 30.78 |
| 44302.416666666664 | 30.77 |
| 44302.427083333336 | 30.79 |
| 44302.4375 | 30.87 |
| 44302.447916666664 | 30.91 |
| 44302.458333333336 | 30.96 |
| 44302.46875 | 31.01 |
| 44302.479166666664 | 31.13 |
| 44302.489583333336 | 31.28 |
| 44302.5 | 31.52 |
| 44302.510416666664 | 31.67 |
| 44302.520833333336 | 31.75 |
| 44302.53125 | 31.82 |
| 44302.541666666664 | 31.84 |
| 44302.552083333336 | 31.89 |
| 44302.5625 | 31.91 |
| 44302.572916666664 | 31.92 |
| 44302.583333333336 | 31.93 |
| 44302.59375 | 31.95 |
| 44302.604166666664 | 31.98 |
| 44302.614583333336 | 32 |
| 44302.625 | 32.03 |
| 44302.635416666664 | 32.07 |
| 44302.645833333336 | 32.1 |
| 44302.65625 | 32.12 |
| 44302.666666666664 | 32.12 |
| 44302.677083333336 | 32.13 |
| 44302.6875 | 32.14 |
| 44302.697916666664 | 32.12 |
| 44302.708333333336 | 32.1 |
| 44302.71875 | 32.11 |
| 44302.729166666664 | 32.13 |
| 44302.739583333336 | 32.14 |
| 44302.75 | 32.09 |
| 44302.760416666664 | 32.07 |
| 44302.770833333336 | 32.05 |
| 44302.78125 | 32.03 |
| 44302.791666666664 | 32.03 |
| 44302.802083333336 | 32.04 |
| 44302.8125 | 31.89 |
| 44302.822916666664 | 31.91 |
| 44302.833333333336 | 31.82 |
| 44302.84375 | 31.79 |
| 44302.854166666664 | 31.7 |
| 44302.864583333336 | 31.65 |
| 44302.875 | 31.33 |
| 44302.885416666664 | 31.2 |
| 44302.895833333336 | 31.13 |
| 44302.90625 | 31.09 |
| 44302.916666666664 | 31.08 |
| 44302.927083333336 | 31.09 |
| 44302.9375 | 31.25 |
| 44302.947916666664 | 31.3 |
| 44302.958333333336 | 31.34 |
| 44302.96875 | 31.44 |
| 44302.979166666664 | 31.54 |
| 44302.989583333336 | 31.66 |
| 44303.0 | 31.88 |
| 44303.010416666664 | 31.95 |
| 44303.020833333336 | 32.01 |
| 44303.03125 | 32.05 |
| 44303.041666666664 | 32.07 |
| 44303.052083333336 | 32.08 |
| 44303.0625 | 32.09 |
| 44303.072916666664 | 32.1 |
| 44303.083333333336 | 32.11 |
| 44303.09375 | 32.13 |
| 44303.104166666664 | 32.14 |
| 44303.114583333336 | 32.16 |
| 44303.125 | 32.18 |
| 44303.135416666664 | 32.19 |
| 44303.145833333336 | 32.19 |
| 44303.15625 | 32.18 |
| 44303.166666666664 | 32.19 |
| 44303.177083333336 | 32.19 |
| 44303.1875 | 32.19 |
| 44303.197916666664 | 32.19 |
| 44303.208333333336 | 32.15 |
| 44303.21875 | 32.16 |
| 44303.229166666664 | 32.15 |
| 44303.239583333336 | 32.16 |
| 44303.25 | 32.12 |
| 44303.260416666664 | 32.11 |
| 44303.270833333336 | 32.08 |
| 44303.28125 | 32.09 |
| 44303.291666666664 | 32.05 |
| 44303.302083333336 | 31.99 |
| 44303.3125 | 31.97 |
| 44303.322916666664 | 31.95 |
| 44303.333333333336 | 31.93 |
| 44303.34375 | 31.82 |
| 44303.354166666664 | 31.65 |
| 44303.364583333336 | 31.43 |
| 44303.375 | 31.11 |
| 44303.385416666664 | 30.92 |
| 44303.395833333336 | 30.75 |
| 44303.40625 | 30.67 |
| 44303.416666666664 | 30.56 |
| 44303.427083333336 | 30.49 |
| 44303.4375 | 30.39 |
| 44303.447916666664 | 30.36 |
| 44303.458333333336 | 30.32 |
| 44303.46875 | 30.33 |
| 44303.479166666664 | 30.34 |
| 44303.489583333336 | 30.43 |
| 44303.5 | 30.47 |
| 44303.510416666664 | 30.5 |
| 44303.520833333336 | 30.59 |
| 44303.53125 | 30.72 |
| 44303.541666666664 | 30.91 |
| 44303.552083333336 | 31.23 |
| 44303.5625 | 31.57 |
| 44303.572916666664 | 31.78 |
| 44303.583333333336 | 31.82 |
| 44303.59375 | 31.86 |
| 44303.604166666664 | 31.89 |
| 44303.614583333336 | 31.91 |
| 44303.625 | 31.96 |
| 44303.635416666664 | 32.01 |
| 44303.645833333336 | 32.05 |
| 44303.65625 | 32.08 |
| 44303.666666666664 | 32.1 |
| 44303.677083333336 | 32.1 |
| 44303.6875 | 32.12 |
| 44303.697916666664 | 32.12 |
| 44303.708333333336 | 32.13 |
| 44303.71875 | 32.04 |
| 44303.729166666664 | 32.1 |
| 44303.739583333336 | 32.09 |
| 44303.75 | 32.13 |
| 44303.760416666664 | 32.1 |
| 44303.770833333336 | 32.12 |
| 44303.78125 | 31.97 |
| 44303.791666666664 | 32.1 |
| 44303.802083333336 | 31.94 |
| 44303.8125 | 31.99 |
| 44303.822916666664 | 31.86 |
| 44303.833333333336 | 31.79 |
| 44303.84375 | 31.58 |
| 44303.854166666664 | 31.29 |
| 44303.864583333336 | 31.13 |
| 44303.875 | 31.03 |
| 44303.885416666664 | 30.92 |
| 44303.895833333336 | 30.87 |
| 44303.90625 | 30.77 |
| 44303.916666666664 | 30.65 |
| 44303.927083333336 | 30.56 |
| 44303.9375 | 30.51 |
| 44303.947916666664 | 30.53 |
| 44303.958333333336 | 30.73 |
| 44303.96875 | 30.79 |
| 44303.979166666664 | 30.86 |
| 44303.989583333336 | 31.03 |
| 44304.0 | 31.23 |
| 44304.010416666664 | 31.43 |
| 44304.020833333336 | 31.6 |
| 44304.03125 | 31.77 |
| 44304.041666666664 | 31.92 |
| 44304.052083333336 | 31.99 |
| 44304.0625 | 32.04 |
| 44304.072916666664 | 32.07 |
| 44304.083333333336 | 32.08 |
| 44304.09375 | 32.09 |
| 44304.104166666664 | 32.1 |
| 44304.114583333336 | 32.11 |
| 44304.125 | 32.14 |
| 44304.135416666664 | 32.16 |
| 44304.145833333336 | 32.17 |
| 44304.15625 | 32.18 |
| 44304.166666666664 | 32.21 |
| 44304.177083333336 | 32.23 |
| 44304.1875 | 32.24 |
| 44304.197916666664 | 32.25 |
| 44304.208333333336 | 32.25 |
| 44304.21875 | 32.26 |
| 44304.229166666664 | 32.26 |
| 44304.239583333336 | 32.22 |
| 44304.25 | 32.22 |
| 44304.260416666664 | 32.22 |
| 44304.270833333336 | 32.2 |
| 44304.28125 | 32.19 |
| 44304.291666666664 | 32.18 |
| 44304.302083333336 | 32.17 |
| 44304.3125 | 32.12 |
| 44304.322916666664 | 32.11 |
| 44304.333333333336 | 32.08 |
| 44304.34375 | 32.06 |
| 44304.354166666664 | 32.01 |
| 44304.364583333336 | 31.98 |
| 44304.375 | 31.9 |
| 44304.385416666664 | 31.86 |
| 44304.395833333336 | 31.68 |
| 44304.40625 | 31.53 |
| 44304.416666666664 | 31.42 |
| 44304.427083333336 | 31.27 |
| 44304.4375 | 31.18 |
| 44304.447916666664 | 31.07 |
| 44304.458333333336 | 30.97 |
| 44304.46875 | 30.91 |
| 44304.479166666664 | 30.86 |
| 44304.489583333336 | 30.86 |
| 44304.5 | 30.87 |
| 44304.510416666664 | 30.97 |
| 44304.520833333336 | 31.02 |
| 44304.53125 | 31.05 |
| 44304.541666666664 | 31.14 |
| 44304.552083333336 | 31.28 |
| 44304.5625 | 31.43 |
| 44304.572916666664 | 31.64 |
| 44304.583333333336 | 31.84 |
| 44304.59375 | 31.96 |
| 44304.604166666664 | 32.03 |
| 44304.614583333336 | 32.09 |
| 44304.625 | 32.11 |
| 44304.635416666664 | 32.12 |
| 44304.645833333336 | 32.13 |
| 44304.65625 | 32.15 |
| 44304.666666666664 | 32.15 |
| 44304.677083333336 | 32.15 |
| 44304.6875 | 32.17 |
| 44304.697916666664 | 32.19 |
| 44304.708333333336 | 32.18 |
| 44304.71875 | 32.18 |
| 44304.729166666664 | 32.17 |
| 44304.739583333336 | 32.15 |
| 44304.75 | 32.05 |
| 44304.760416666664 | 32.19 |
| 44304.770833333336 | 32.16 |
| 44304.78125 | 32.12 |
| 44304.791666666664 | 32.12 |
| 44304.802083333336 | 32.21 |
| 44304.8125 | 32.08 |
| 44304.822916666664 | 32.2 |
| 44304.833333333336 | 31.95 |
| 44304.84375 | 31.95 |
| 44304.854166666664 | 31.93 |
| 44304.864583333336 | 31.95 |
| 44304.875 | 31.85 |
| 44304.885416666664 | 31.73 |
| 44304.895833333336 | 31.57 |
| 44304.90625 | 31.33 |
| 44304.916666666664 | 31.21 |
| 44304.927083333336 | 31.13 |
| 44304.9375 | 31.06 |
| 44304.947916666664 | 31.03 |
| 44304.958333333336 | 31.03 |
| 44304.96875 | 31 |
| 44304.979166666664 | 31 |
| 44304.989583333336 | 31.01 |
| 44305.0 | 31.05 |
| 44305.010416666664 | 31.16 |
| 44305.020833333336 | 31.18 |
| 44305.03125 | 31.28 |
| 44305.041666666664 | 31.42 |
| 44305.052083333336 | 31.62 |
| 44305.0625 | 31.75 |
| 44305.072916666664 | 31.87 |
| 44305.083333333336 | 32 |
| 44305.09375 | 32.07 |
| 44305.104166666664 | 32.11 |
| 44305.114583333336 | 32.13 |
| 44305.125 | 32.14 |
| 44305.135416666664 | 32.16 |
| 44305.145833333336 | 32.18 |
| 44305.15625 | 32.19 |
| 44305.166666666664 | 32.21 |
| 44305.177083333336 | 32.24 |
| 44305.1875 | 32.26 |
| 44305.197916666664 | 32.27 |
| 44305.208333333336 | 32.29 |
| 44305.21875 | 32.31 |
| 44305.229166666664 | 32.33 |
| 44305.239583333336 | 32.34 |
| 44305.25 | 32.35 |
| 44305.260416666664 | 32.36 |
| 44305.270833333336 | 32.33 |
| 44305.28125 | 32.31 |
| 44305.291666666664 | 32.26 |
| 44305.302083333336 | 32.28 |
| 44305.3125 | 32.25 |
| 44305.322916666664 | 32.19 |
| 44305.333333333336 | 32.17 |
| 44305.34375 | 32.15 |
| 44305.354166666664 | 32.13 |
| 44305.364583333336 | 32.12 |
| 44305.375 | 32.05 |
| 44305.385416666664 | 32.03 |
| 44305.395833333336 | 31.93 |
| 44305.40625 | 31.88 |
| 44305.416666666664 | 31.74 |
| 44305.427083333336 | 31.55 |
| 44305.4375 | 31.48 |
| 44305.447916666664 | 31.35 |
| 44305.458333333336 | 31.26 |
| 44305.46875 | 31.16 |
| 44305.479166666664 | 31.04 |
| 44305.489583333336 | 30.93 |
| 44305.5 | 30.84 |
| 44305.510416666664 | 30.76 |
| 44305.520833333336 | 30.75 |
| 44305.53125 | 30.75 |
| 44305.541666666664 | 30.82 |
| 44305.552083333336 | 30.88 |
| 44305.5625 | 30.89 |
| 44305.572916666664 | 30.93 |
| 44305.583333333336 | 31.05 |
| 44305.59375 | 31.17 |
| 44305.604166666664 | 31.34 |
| 44305.614583333336 | 31.55 |
| 44305.625 | 31.75 |
| 44305.635416666664 | 31.89 |
| 44305.645833333336 | 31.97 |
| 44305.65625 | 32.04 |
| 44305.666666666664 | 32.08 |
| 44305.677083333336 | 32.11 |
| 44305.6875 | 32.14 |
| 44305.697916666664 | 32.15 |
| 44305.708333333336 | 32.18 |
| 44305.71875 | 32.21 |
| 44305.729166666664 | 32.21 |
| 44305.739583333336 | 32.21 |
| 44305.75 | 32.2 |
| 44305.760416666664 | 32.22 |
| 44305.770833333336 | 32.28 |
| 44305.78125 | 32.24 |
| 44305.791666666664 | 32.2 |
| 44305.802083333336 | 32.14 |
| 44305.8125 | 32.1 |
| 44305.822916666664 | 32.02 |
| 44305.833333333336 | 31.94 |
| 44305.84375 | 31.79 |
| 44305.854166666664 | 31.67 |
| 44305.864583333336 | 31.59 |
| 44305.875 | 31.55 |
| 44305.885416666664 | 31.34 |
| 44305.895833333336 | 31.22 |
| 44305.90625 | 31.05 |
| 44305.916666666664 | 30.92 |
| 44305.927083333336 | 30.75 |
| 44305.9375 | 30.55 |
| 44305.947916666664 | 30.47 |
| 44305.958333333336 | 30.41 |
| 44305.96875 | 30.39 |
| 44305.979166666664 | 30.37 |
| 44305.989583333336 | 30.35 |
| 44306.0 | 30.35 |
| 44306.010416666664 | 30.36 |
| 44306.020833333336 | 30.38 |
| 44306.03125 | 30.42 |
| 44306.041666666664 | 30.46 |
| 44306.052083333336 | 30.55 |
| 44306.0625 | 30.73 |
| 44306.072916666664 | 30.87 |
| 44306.083333333336 | 31.23 |
| 44306.09375 | 31.38 |
| 44306.104166666664 | 31.47 |
| 44306.114583333336 | 31.57 |
| 44306.125 | 31.62 |
| 44306.135416666664 | 31.68 |
| 44306.145833333336 | 31.72 |
| 44306.15625 | 31.73 |
| 44306.166666666664 | 31.74 |
| 44306.177083333336 | 31.75 |
| 44306.1875 | 31.81 |
| 44306.197916666664 | 31.87 |
| 44306.208333333336 | 31.91 |
| 44306.21875 | 31.95 |
| 44306.229166666664 | 32 |
| 44306.239583333336 | 32.03 |
| 44306.25 | 32.05 |
| 44306.260416666664 | 32.09 |
| 44306.270833333336 | 32.12 |
| 44306.28125 | 32.13 |
| 44306.291666666664 | 32.14 |
| 44306.302083333336 | 32.18 |
| 44306.3125 | 32.18 |
| 44306.322916666664 | 32.12 |
| 44306.333333333336 | 32.15 |
| 44306.34375 | 32.13 |
| 44306.354166666664 | 32.05 |
| 44306.364583333336 | 31.98 |
| 44306.375 | 31.85 |
| 44306.385416666664 | 31.85 |
| 44306.395833333336 | 31.66 |
| 44306.40625 | 31.55 |
| 44306.416666666664 | 31.56 |
| 44306.427083333336 | 31.34 |
| 44306.4375 | 31.3 |
| 44306.447916666664 | 31.22 |
| 44306.458333333336 | 30.9 |
| 44306.46875 | 30.68 |
| 44306.479166666664 | 30.44 |
| 44306.489583333336 | 30.14 |
| 44306.5 | 29.94 |
| 44306.510416666664 | 29.85 |
| 44306.520833333336 | 29.78 |
| 44306.53125 | 29.78 |
| 44306.541666666664 | 29.8 |
| 44306.552083333336 | 29.85 |
| 44306.5625 | 29.94 |
| 44306.572916666664 | 30.02 |
| 44306.583333333336 | 30.04 |
| 44306.59375 | 30.06 |
| 44306.604166666664 | 30.17 |
| 44306.614583333336 | 30.32 |
| 44306.625 | 30.52 |
| 44306.635416666664 | 30.65 |
| 44306.645833333336 | 30.88 |
| 44306.65625 | 31.03 |
| 44306.666666666664 | 31.36 |
| 44306.677083333336 | 31.46 |
| 44306.6875 | 31.57 |
| 44306.697916666664 | 31.63 |
| 44306.708333333336 | 31.66 |
| 44306.71875 | 31.72 |
| 44306.729166666664 | 31.72 |
| 44306.739583333336 | 31.76 |
| 44306.75 | 31.76 |
| 44306.760416666664 | 31.79 |
| 44306.770833333336 | 31.8 |
| 44306.78125 | 31.81 |
| 44306.791666666664 | 31.83 |
| 44306.802083333336 | 31.76 |
| 44306.8125 | 31.82 |
| 44306.822916666664 | 31.82 |
| 44306.833333333336 | 31.81 |
| 44306.84375 | 31.77 |
| 44306.854166666664 | 31.78 |
| 44306.864583333336 | 31.65 |
| 44306.875 | 31.77 |
| 44306.885416666664 | 31.78 |
| 44306.895833333336 | 31.75 |
| 44306.90625 | 31.77 |
| 44306.916666666664 | 31.79 |
| 44306.927083333336 | 31.74 |
| 44306.9375 | 31.71 |
| 44306.947916666664 | 31.69 |
| 44306.958333333336 | 31.69 |
| 44306.96875 | 31.69 |
| 44306.979166666664 | 31.51 |
| 44306.989583333336 | 31.26 |
| 44307.0 | 31.07 |
| 44307.010416666664 | 30.94 |
| 44307.020833333336 | 30.89 |
| 44307.03125 | 30.9 |
| 44307.041666666664 | 30.93 |
| 44307.052083333336 | 31 |
| 44307.0625 | 31.09 |
| 44307.072916666664 | 31.12 |
| 44307.083333333336 | 31.14 |
| 44307.09375 | 31.44 |
| 44307.104166666664 | 31.44 |
| 44307.114583333336 | 31.56 |
| 44307.125 | 31.73 |
| 44307.135416666664 | 31.84 |
| 44307.145833333336 | 31.95 |
| 44307.15625 | 32.02 |
| 44307.166666666664 | 32.09 |
| 44307.177083333336 | 32.17 |
| 44307.1875 | 32.22 |
| 44307.197916666664 | 32.26 |
| 44307.208333333336 | 32.29 |
| 44307.21875 | 32.32 |
| 44307.229166666664 | 32.37 |
| 44307.239583333336 | 32.39 |
| 44307.25 | 32.42 |
| 44307.260416666664 | 32.45 |
| 44307.270833333336 | 32.48 |
| 44307.28125 | 32.51 |
| 44307.291666666664 | 32.55 |
| 44307.302083333336 | 32.57 |
| 44307.3125 | 32.58 |
| 44307.322916666664 | 32.58 |
| 44307.333333333336 | 32.58 |
| 44307.34375 | 32.57 |
| 44307.354166666664 | 32.54 |
| 44307.364583333336 | 32.49 |
| 44307.375 | 32.46 |
| 44307.385416666664 | 32.46 |
| 44307.395833333336 | 32.45 |
| 44307.40625 | 32.39 |
| 44307.416666666664 | 32.43 |
| 44307.427083333336 | 32.31 |
| 44307.4375 | 32.26 |
| 44307.447916666664 | 32.27 |
| 44307.458333333336 | 32.23 |
| 44307.46875 | 32.16 |
| 44307.479166666664 | 31.88 |
| 44307.489583333336 | 31.66 |
| 44307.5 | 31.36 |
| 44307.510416666664 | 31.05 |
| 44307.520833333336 | 30.82 |
| 44307.53125 | 30.67 |
| 44307.541666666664 | 30.56 |
| 44307.552083333336 | 30.5 |
| 44307.5625 | 30.49 |
| 44307.572916666664 | 30.47 |
| 44307.583333333336 | 30.48 |
| 44307.59375 | 30.54 |
| 44307.604166666664 | 30.61 |
| 44307.614583333336 | 30.76 |
| 44307.625 | 30.95 |
| 44307.635416666664 | 31.19 |
| 44307.645833333336 | 31.47 |
| 44307.65625 | 31.7 |
| 44307.666666666664 | 31.88 |
| 44307.677083333336 | 32.14 |
| 44307.6875 | 32.23 |
| 44307.697916666664 | 32.29 |
| 44307.708333333336 | 32.37 |
| 44307.71875 | 32.48 |
| 44307.729166666664 | 32.55 |
| 44307.739583333336 | 32.65 |
| 44307.75 | 32.68 |
| 44307.760416666664 | 32.71 |
| 44307.770833333336 | 32.72 |
| 44307.78125 | 32.74 |
| 44307.791666666664 | 32.74 |
| 44307.802083333336 | 32.75 |
| 44307.8125 | 32.68 |
| 44307.822916666664 | 32.62 |
| 44307.833333333336 | 32.61 |
| 44307.84375 | 32.67 |
| 44307.854166666664 | 32.67 |
| 44307.864583333336 | 32.7 |
| 44307.875 | 32.68 |
| 44307.885416666664 | 32.69 |
| 44307.895833333336 | 32.65 |
| 44307.90625 | 32.65 |
| 44307.916666666664 | 32.63 |
| 44307.927083333336 | 32.61 |
| 44307.9375 | 32.58 |
| 44307.947916666664 | 32.47 |
| 44307.958333333336 | 32.35 |
| 44307.96875 | 31.89 |
| 44307.979166666664 | 31.55 |
| 44307.989583333336 | 31.16 |
| 44308.0 | 30.87 |
| 44308.010416666664 | 30.67 |
| 44308.020833333336 | 30.49 |
| 44308.03125 | 30.34 |
| 44308.041666666664 | 30.14 |
| 44308.052083333336 | 30.05 |
| 44308.0625 | 30.03 |
| 44308.072916666664 | 29.9 |
| 44308.083333333336 | 29.9 |
| 44308.09375 | 29.81 |
| 44308.104166666664 | 29.77 |
| 44308.114583333336 | 29.73 |
| 44308.125 | 29.75 |
| 44308.135416666664 | 29.95 |
| 44308.145833333336 | 30.03 |
| 44308.15625 | 30.22 |
| 44308.166666666664 | 30.86 |
| 44308.177083333336 | 31.45 |
| 44308.1875 | 31.72 |
| 44308.197916666664 | 31.91 |
| 44308.208333333336 | 32.08 |
| 44308.21875 | 32.12 |
| 44308.229166666664 | 32.12 |
| 44308.239583333336 | 32.14 |
| 44308.25 | 32.19 |
| 44308.260416666664 | 32.23 |
| 44308.270833333336 | 32.18 |
| 44308.28125 | 32.29 |
| 44308.291666666664 | 32.4 |
| 44308.302083333336 | 32.48 |
| 44308.3125 | 32.48 |
| 44308.322916666664 | 32.52 |
| 44308.333333333336 | 32.52 |
| 44308.34375 | 32.54 |
| 44308.354166666664 | 32.53 |
| 44308.364583333336 | 32.52 |
| 44308.375 | 32.48 |
| 44308.385416666664 | 32.48 |
| 44308.395833333336 | 32.46 |
| 44308.40625 | 32.44 |
| 44308.416666666664 | 32.46 |
| 44308.427083333336 | 32.47 |
| 44308.4375 | 32.51 |
| 44308.447916666664 | 32.43 |
| 44308.458333333336 | 32.37 |
| 44308.46875 | 32.4 |
| 44308.479166666664 | 32.4 |
| 44308.489583333336 | 32.28 |
| 44308.5 | 32.16 |
| 44308.510416666664 | 32.15 |
| 44308.520833333336 | 32.12 |
| 44308.53125 | 32.06 |
| 44308.541666666664 | 31.99 |
| 44308.552083333336 | 31.81 |
| 44308.5625 | 31.68 |
| 44308.572916666664 | 31.53 |
| 44308.583333333336 | 31.29 |
| 44308.59375 | 31.36 |
| 44308.604166666664 | 31.16 |
| 44308.614583333336 | 30.76 |
| 44308.625 | 30.65 |
| 44308.635416666664 | 30.66 |
| 44308.645833333336 | 30.38 |
| 44308.65625 | 30.44 |
| 44308.666666666664 | 30.62 |
| 44308.677083333336 | 30.72 |
| 44308.6875 | 30.81 |
| 44308.697916666664 | 31.03 |
| 44308.708333333336 | 31.38 |
| 44308.71875 | 31.78 |
| 44308.729166666664 | 31.92 |
| 44308.739583333336 | 32.03 |
| 44308.75 | 32.14 |
| 44308.760416666664 | 32.19 |
| 44308.770833333336 | 32.21 |
| 44308.78125 | 32.23 |
| 44308.791666666664 | 32.27 |
| 44308.802083333336 | 32.32 |
| 44308.8125 | 32.37 |
| 44308.822916666664 | 32.42 |
| 44308.833333333336 | 32.44 |
| 44308.84375 | 32.47 |
| 44308.854166666664 | 32.49 |
| 44308.864583333336 | 32.49 |
| 44308.875 | 32.49 |
| 44308.885416666664 | 32.49 |
| 44308.895833333336 | 32.48 |
| 44308.90625 | 32.39 |
| 44308.916666666664 | 32.42 |
| 44308.927083333336 | 32.48 |
| 44308.9375 | 32.5 |
| 44308.947916666664 | 32.46 |
| 44308.958333333336 | 32.47 |
| 44308.96875 | 32.49 |
| 44308.979166666664 | 32.48 |
| 44308.989583333336 | 32.47 |
| 44309.0 | 32.39 |
| 44309.010416666664 | 32.2 |
| 44309.020833333336 | 31.97 |
| 44309.03125 | 31.69 |
| 44309.041666666664 | 31.39 |
| 44309.052083333336 | 31.05 |
| 44309.0625 | 30.79 |
| 44309.072916666664 | 30.56 |
| 44309.083333333336 | 30.31 |
| 44309.09375 | 30.06 |
| 44309.104166666664 | 30.07 |
| 44309.114583333336 | 29.87 |
| 44309.125 | 29.86 |
| 44309.135416666664 | 29.82 |
| 44309.145833333336 | 29.84 |
| 44309.15625 | 29.85 |
| 44309.166666666664 | 29.91 |
| 44309.177083333336 | 29.9 |
| 44309.1875 | 29.84 |
| 44309.197916666664 | 29.88 |
| 44309.208333333336 | 30.07 |
| 44309.21875 | 30.45 |
| 44309.229166666664 | 30.73 |
| 44309.239583333336 | 31.18 |
| 44309.25 | 31.41 |
| 44309.260416666664 | 31.68 |
| 44309.270833333336 | 31.86 |
| 44309.28125 | 31.92 |
| 44309.291666666664 | 31.99 |
| 44309.302083333336 | 32.07 |
| 44309.3125 | 32.15 |
| 44309.322916666664 | 32.23 |
| 44309.333333333336 | 32.29 |
| 44309.34375 | 32.35 |
| 44309.354166666664 | 32.39 |
| 44309.364583333336 | 32.4 |
| 44309.375 | 32.4 |
| 44309.385416666664 | 32.39 |
| 44309.395833333336 | 32.38 |
| 44309.40625 | 32.37 |
| 44309.416666666664 | 32.35 |
| 44309.427083333336 | 32.29 |
| 44309.4375 | 32.32 |
| 44309.447916666664 | 32.33 |
| 44309.458333333336 | 32.35 |
| 44309.46875 | 32.3 |
| 44309.479166666664 | 32.24 |
| 44309.489583333336 | 32.17 |
| 44309.5 | 32.21 |
| 44309.510416666664 | 32.15 |
| 44309.520833333336 | 31.9 |
| 44309.53125 | 31.62 |
| 44309.541666666664 | 31.26 |
| 44309.552083333336 | 30.94 |
| 44309.5625 | 30.85 |
| 44309.572916666664 | 30.54 |
| 44309.583333333336 | 30.51 |
| 44309.59375 | 30.17 |
| 44309.604166666664 | 30.23 |
| 44309.614583333336 | 29.64 |
| 44309.625 | 29.75 |
| 44309.635416666664 | 29.68 |
| 44309.645833333336 | 29.72 |
| 44309.65625 | 29.6 |
| 44309.666666666664 | 29.63 |
| 44309.677083333336 | 29.48 |
| 44309.6875 | 29.6 |
| 44309.697916666664 | 29.67 |
| 44309.708333333336 | 29.62 |
| 44309.71875 | 29.59 |
| 44309.729166666664 | 29.58 |
| 44309.739583333336 | 29.69 |
| 44309.75 | 30.04 |
| 44309.760416666664 | 30.34 |
| 44309.770833333336 | 30.62 |
| 44309.78125 | 30.84 |
| 44309.791666666664 | 31.16 |
| 44309.802083333336 | 31.33 |
| 44309.8125 | 31.46 |
| 44309.822916666664 | 31.63 |
| 44309.833333333336 | 31.71 |
| 44309.84375 | 31.79 |
| 44309.854166666664 | 31.92 |
| 44309.864583333336 | 32.01 |
| 44309.875 | 32.08 |
| 44309.885416666664 | 32.13 |
| 44309.895833333336 | 32.15 |
| 44309.90625 | 32.15 |
| 44309.916666666664 | 32.17 |
| 44309.927083333336 | 32.17 |
| 44309.9375 | 32.19 |
| 44309.947916666664 | 32.21 |
| 44309.958333333336 | 32.15 |
| 44309.96875 | 32.09 |
| 44309.979166666664 | 32.09 |
| 44309.989583333336 | 32.09 |
| 44310.0 | 32.18 |
| 44310.010416666664 | 32.12 |
| 44310.020833333336 | 32.07 |
| 44310.03125 | 32.07 |
| 44310.041666666664 | 32.06 |
| 44310.052083333336 | 31.84 |
| 44310.0625 | 31.42 |
| 44310.072916666664 | 31.36 |
| 44310.083333333336 | 30.87 |
| 44310.09375 | 30.66 |
| 44310.104166666664 | 30.43 |
| 44310.114583333336 | 30.2 |
| 44310.125 | 30.05 |
| 44310.135416666664 | 29.95 |
| 44310.145833333336 | 29.99 |
| 44310.15625 | 29.94 |
| 44310.166666666664 | 29.93 |
| 44310.177083333336 | 29.92 |
| 44310.1875 | 29.91 |
| 44310.197916666664 | 29.91 |
| 44310.208333333336 | 29.97 |
| 44310.21875 | 30.03 |
| 44310.229166666664 | 29.93 |
| 44310.239583333336 | 29.93 |
| 44310.25 | 29.92 |
| 44310.260416666664 | 29.96 |
| 44310.270833333336 | 30.28 |
| 44310.28125 | 30.45 |
| 44310.291666666664 | 30.69 |
| 44310.302083333336 | 30.91 |
| 44310.3125 | 31.16 |
| 44310.322916666664 | 31.38 |
| 44310.333333333336 | 31.54 |
| 44310.34375 | 31.71 |
| 44310.354166666664 | 31.89 |
| 44310.364583333336 | 32 |
| 44310.375 | 32.08 |
| 44310.385416666664 | 32.12 |
| 44310.395833333336 | 32.15 |
| 44310.40625 | 32.19 |
| 44310.416666666664 | 32.2 |
| 44310.427083333336 | 32.2 |
| 44310.4375 | 32.2 |
| 44310.447916666664 | 32.2 |
| 44310.458333333336 | 32.2 |
| 44310.46875 | 32.12 |
| 44310.479166666664 | 32.12 |
| 44310.489583333336 | 32.14 |
| 44310.5 | 32.09 |
| 44310.510416666664 | 32.08 |
| 44310.520833333336 | 32.08 |
| 44310.53125 | 32.06 |
| 44310.541666666664 | 32.09 |
| 44310.552083333336 | 32.08 |
| 44310.5625 | 31.93 |
| 44310.572916666664 | 31.6 |
| 44310.583333333336 | 31.23 |
| 44310.59375 | 30.83 |
| 44310.604166666664 | 30.58 |
| 44310.614583333336 | 30.42 |
| 44310.625 | 30.2 |
| 44310.635416666664 | 30.02 |
| 44310.645833333336 | 29.92 |
| 44310.65625 | 29.78 |
| 44310.666666666664 | 29.83 |
| 44310.677083333336 | 29.84 |
| 44310.6875 | 29.86 |
| 44310.697916666664 | 29.83 |
| 44310.708333333336 | 29.81 |
| 44310.71875 | 29.86 |
| 44310.729166666664 | 29.9 |
| 44310.739583333336 | 29.88 |
| 44310.75 | 29.83 |
| 44310.760416666664 | 29.87 |
| 44310.770833333336 | 29.97 |
| 44310.78125 | 30.3 |
| 44310.791666666664 | 30.67 |
| 44310.802083333336 | 30.84 |
| 44310.8125 | 31.12 |
| 44310.822916666664 | 31.37 |
| 44310.833333333336 | 31.61 |
| 44310.84375 | 31.82 |
| 44310.854166666664 | 31.98 |
| 44310.864583333336 | 32.09 |
| 44310.875 | 32.14 |
| 44310.885416666664 | 32.19 |
| 44310.895833333336 | 32.22 |
| 44310.90625 | 32.25 |
| 44310.916666666664 | 32.25 |
| 44310.927083333336 | 32.25 |
| 44310.9375 | 32.25 |
| 44310.947916666664 | 32.33 |
| 44310.958333333336 | 32.29 |
| 44310.96875 | 32.31 |
| 44310.979166666664 | 32.3 |
| 44310.989583333336 | 32.29 |
| 44311.0 | 32.19 |
| 44311.010416666664 | 32.18 |
| 44311.020833333336 | 32.2 |
| 44311.03125 | 32.21 |
| 44311.041666666664 | 32.14 |
| 44311.052083333336 | 32.18 |
| 44311.0625 | 32.16 |
| 44311.072916666664 | 32.13 |
| 44311.083333333336 | 32.13 |
| 44311.09375 | 32.01 |
| 44311.104166666664 | 31.96 |
| 44311.114583333336 | 31.87 |
| 44311.125 | 31.71 |
| 44311.135416666664 | 31.55 |
| 44311.145833333336 | 31.37 |
| 44311.15625 | 31.24 |
| 44311.166666666664 | 30.94 |
| 44311.177083333336 | 30.6 |
| 44311.1875 | 30.17 |
| 44311.197916666664 | 29.96 |
| 44311.208333333336 | 29.79 |
| 44311.21875 | 29.84 |
| 44311.229166666664 | 29.96 |
| 44311.239583333336 | 29.48 |
| 44311.25 | 29.91 |
| 44311.260416666664 | 29.91 |
| 44311.270833333336 | 30.22 |
| 44311.28125 | 30.3 |
| 44311.291666666664 | 30.62 |
| 44311.302083333336 | 30.74 |
| 44311.3125 | 30.92 |
| 44311.322916666664 | 31.1 |
| 44311.333333333336 | 31.22 |
| 44311.34375 | 31.3 |
| 44311.354166666664 | 31.39 |
| 44311.364583333336 | 31.47 |
| 44311.375 | 31.55 |
| 44311.385416666664 | 31.6 |
| 44311.395833333336 | 31.64 |
| 44311.40625 | 31.69 |
| 44311.416666666664 | 31.74 |
| 44311.427083333336 | 31.85 |
| 44311.4375 | 31.85 |
| 44311.447916666664 | 31.92 |
| 44311.458333333336 | 31.99 |
| 44311.46875 | 32.07 |
| 44311.479166666664 | 32.05 |
| 44311.489583333336 | 32.07 |
| 44311.5 | 32.08 |
| 44311.510416666664 | 32.13 |
| 44311.520833333336 | 31.97 |
| 44311.53125 | 32.05 |
| 44311.541666666664 | 32.01 |
| 44311.552083333336 | 31.95 |
| 44311.5625 | 31.88 |
| 44311.572916666664 | 31.85 |
| 44311.583333333336 | 31.75 |
| 44311.59375 | 31.61 |
| 44311.604166666664 | 31.47 |
| 44311.614583333336 | 31.31 |
| 44311.625 | 31.26 |
| 44311.635416666664 | 31.18 |
| 44311.645833333336 | 31.1 |
| 44311.65625 | 30.9 |
| 44311.666666666664 | 30.19 |
| 44311.677083333336 | 29.69 |
| 44311.6875 | 29.11 |
| 44311.697916666664 | 28.99 |
| 44311.708333333336 | 28.58 |
| 44311.71875 | 28.49 |
| 44311.729166666664 | 28.57 |
| 44311.739583333336 | 28.37 |
| 44311.75 | 28.4 |
| 44311.760416666664 | 28.44 |
| 44311.770833333336 | 28.54 |
| 44311.78125 | 28.5 |
| 44311.791666666664 | 28.7 |
| 44311.802083333336 | 29.24 |
| 44311.8125 | 30.1 |
| 44311.822916666664 | 30.38 |
| 44311.833333333336 | 30.53 |
| 44311.84375 | 30.73 |
| 44311.854166666664 | 30.83 |
| 44311.864583333336 | 31 |
| 44311.875 | 31.25 |
| 44311.885416666664 | 31.5 |
| 44311.895833333336 | 31.64 |
| 44311.90625 | 31.74 |
| 44311.916666666664 | 31.84 |
| 44311.927083333336 | 31.89 |
| 44311.9375 | 31.91 |
| 44311.947916666664 | 31.92 |
| 44311.958333333336 | 31.95 |
| 44311.96875 | 31.98 |
| 44311.979166666664 | 32 |
| 44311.989583333336 | 32.03 |
| 44312.0 | 32.03 |
| 44312.010416666664 | 32.03 |
| 44312.020833333336 | 32.03 |
| 44312.03125 | 32.04 |
| 44312.041666666664 | 32.02 |
| 44312.052083333336 | 32 |
| 44312.0625 | 31.99 |
| 44312.072916666664 | 31.96 |
| 44312.083333333336 | 31.95 |
| 44312.09375 | 31.94 |
| 44312.104166666664 | 31.9 |
| 44312.114583333336 | 31.84 |
| 44312.125 | 31.77 |
| 44312.135416666664 | 31.74 |
| 44312.145833333336 | 31.67 |
| 44312.15625 | 31.61 |
| 44312.166666666664 | 31.58 |
| 44312.177083333336 | 31.54 |
| 44312.1875 | 31.46 |
| 44312.197916666664 | 31.14 |
| 44312.208333333336 | 30.79 |
| 44312.21875 | 30.68 |
| 44312.229166666664 | 30.37 |
| 44312.239583333336 | 30.05 |
| 44312.25 | 29.81 |
| 44312.260416666664 | 29.56 |
| 44312.270833333336 | 29.56 |
| 44312.28125 | 29.26 |
| 44312.291666666664 | 29.22 |
| 44312.302083333336 | 29.25 |
| 44312.3125 | 29.39 |
| 44312.322916666664 | 29.4 |
| 44312.333333333336 | 29.57 |
| 44312.34375 | 29.96 |
| 44312.354166666664 | 30.49 |
| 44312.364583333336 | 30.82 |
| 44312.375 | 30.98 |
| 44312.385416666664 | 31.07 |
| 44312.395833333336 | 31.15 |
| 44312.40625 | 31.23 |
| 44312.416666666664 | 31.39 |
| 44312.427083333336 | 31.48 |
| 44312.4375 | 31.57 |
| 44312.447916666664 | 31.66 |
| 44312.458333333336 | 31.73 |
| 44312.46875 | 31.77 |
| 44312.479166666664 | 31.8 |
| 44312.489583333336 | 31.82 |
| 44312.5 | 31.85 |
| 44312.510416666664 | 31.88 |
| 44312.520833333336 | 31.91 |
| 44312.53125 | 31.93 |
| 44312.541666666664 | 31.81 |
| 44312.552083333336 | 31.82 |
| 44312.5625 | 31.91 |
| 44312.572916666664 | 31.88 |
| 44312.583333333336 | 31.86 |
| 44312.59375 | 31.84 |
| 44312.604166666664 | 31.79 |
| 44312.614583333336 | 31.79 |
| 44312.625 | 31.69 |
| 44312.635416666664 | 31.73 |
| 44312.645833333336 | 31.55 |
| 44312.65625 | 31.45 |
| 44312.666666666664 | 31.41 |
| 44312.677083333336 | 31.34 |
| 44312.6875 | 31.31 |
| 44312.697916666664 | 31.09 |
| 44312.708333333336 | 30.97 |
| 44312.71875 | 30.87 |
| 44312.729166666664 | 30.02 |
| 44312.739583333336 | 29.74 |
| 44312.75 | 29.8 |
| 44312.760416666664 | 29.56 |
| 44312.770833333336 | 29.32 |
| 44312.78125 | 29.38 |
| 44312.791666666664 | 29.35 |
| 44312.802083333336 | 29.47 |
| 44312.8125 | 29.4 |
| 44312.822916666664 | 29.45 |
| 44312.833333333336 | 29.58 |
| 44312.84375 | 30.09 |
| 44312.854166666664 | 30.87 |
| 44312.864583333336 | 31.03 |
| 44312.875 | 31.08 |
| 44312.885416666664 | 31.09 |
| 44312.895833333336 | 31.21 |
| 44312.90625 | 31.28 |
| 44312.916666666664 | 31.51 |
| 44312.927083333336 | 31.57 |
| 44312.9375 | 31.71 |
| 44312.947916666664 | 31.8 |
| 44312.958333333336 | 31.85 |
| 44312.96875 | 31.89 |
| 44312.979166666664 | 31.93 |
| 44312.989583333336 | 31.97 |
| 44313.0 | 32 |
| 44313.010416666664 | 32.01 |
| 44313.020833333336 | 32.02 |
| 44313.03125 | 32.01 |
| 44313.041666666664 | 32.01 |
| 44313.052083333336 | 32.01 |
| 44313.0625 | 32.01 |
| 44313.072916666664 | 31.98 |
| 44313.083333333336 | 31.98 |
| 44313.09375 | 31.98 |
| 44313.104166666664 | 31.95 |
| 44313.114583333336 | 31.94 |
| 44313.125 | 31.94 |
| 44313.135416666664 | 31.91 |
| 44313.145833333336 | 31.86 |
| 44313.15625 | 31.84 |
| 44313.166666666664 | 31.81 |
| 44313.177083333336 | 31.75 |
| 44313.1875 | 31.74 |
| 44313.197916666664 | 31.7 |
| 44313.208333333336 | 31.61 |
| 44313.21875 | 31.43 |
| 44313.229166666664 | 31.24 |
| 44313.239583333336 | 31.11 |
| 44313.25 | 30.91 |
| 44313.260416666664 | 30.72 |
| 44313.270833333336 | 30.53 |
| 44313.28125 | 30.32 |
| 44313.291666666664 | 30.1 |
| 44313.302083333336 | 29.95 |
| 44313.3125 | 29.97 |
| 44313.322916666664 | 29.98 |
| 44313.333333333336 | 30.06 |
| 44313.34375 | 30.06 |
| 44313.354166666664 | 30.02 |
| 44313.364583333336 | 30.12 |
| 44313.375 | 30.39 |
| 44313.385416666664 | 30.59 |
| 44313.395833333336 | 30.76 |
| 44313.40625 | 30.89 |
| 44313.416666666664 | 31.03 |
| 44313.427083333336 | 31.21 |
| 44313.4375 | 31.33 |
| 44313.447916666664 | 31.45 |
| 44313.458333333336 | 31.54 |
| 44313.46875 | 31.62 |
| 44313.479166666664 | 31.79 |
| 44313.489583333336 | 31.79 |
| 44313.5 | 31.84 |
| 44313.510416666664 | 31.87 |
| 44313.520833333336 | 31.88 |
| 44313.53125 | 31.91 |
| 44313.541666666664 | 31.95 |
| 44313.552083333336 | 32 |
| 44313.5625 | 32.02 |
| 44313.572916666664 | 31.97 |
| 44313.583333333336 | 31.91 |
| 44313.59375 | 31.96 |
| 44313.604166666664 | 31.92 |
| 44313.614583333336 | 31.92 |
| 44313.625 | 31.89 |
| 44313.635416666664 | 31.82 |
| 44313.645833333336 | 31.76 |
| 44313.65625 | 31.7 |
| 44313.666666666664 | 31.67 |
| 44313.677083333336 | 31.68 |
| 44313.6875 | 31.79 |
| 44313.697916666664 | 31.67 |
| 44313.708333333336 | 31.54 |
| 44313.71875 | 31.43 |
| 44313.729166666664 | 31.38 |
| 44313.739583333336 | 31.22 |
| 44313.75 | 31.06 |
| 44313.760416666664 | 30.77 |
| 44313.770833333336 | 30.53 |
| 44313.78125 | 30.35 |
| 44313.791666666664 | 30.04 |
| 44313.802083333336 | 30.02 |
| 44313.8125 | 29.97 |
| 44313.822916666664 | 29.96 |
| 44313.833333333336 | 30.04 |
| 44313.84375 | 30.14 |
| 44313.854166666664 | 30.07 |
| 44313.864583333336 | 30.24 |
| 44313.875 | 30.61 |
| 44313.885416666664 | 30.95 |
| 44313.895833333336 | 31.19 |
| 44313.90625 | 31.25 |
| 44313.916666666664 | 31.46 |
| 44313.927083333336 | 31.68 |
| 44313.9375 | 31.86 |
| 44313.947916666664 | 31.98 |
| 44313.958333333336 | 32.07 |
| 44313.96875 | 32.06 |
| 44313.979166666664 | 32.07 |
| 44313.989583333336 | 32.08 |
| 44314.0 | 32.13 |
| 44314.010416666664 | 32.08 |
| 44314.020833333336 | 32.1 |
| 44314.03125 | 32.17 |
| 44314.041666666664 | 32.15 |
| 44314.052083333336 | 32.17 |
| 44314.0625 | 32.18 |
| 44314.072916666664 | 32.16 |
| 44314.083333333336 | 32.15 |
| 44314.09375 | 32.14 |
| 44314.104166666664 | 32.14 |
| 44314.114583333336 | 32.12 |
| 44314.125 | 32.12 |
| 44314.135416666664 | 32.11 |
| 44314.145833333336 | 32.11 |
| 44314.15625 | 32.11 |
| 44314.166666666664 | 32.11 |
| 44314.177083333336 | 32.12 |
| 44314.1875 | 32.11 |
| 44314.197916666664 | 32.09 |
| 44314.208333333336 | 32.05 |
| 44314.21875 | 32.06 |
| 44314.229166666664 | 31.98 |
| 44314.239583333336 | 31.92 |
| 44314.25 | 31.82 |
| 44314.260416666664 | 31.62 |
| 44314.270833333336 | 31.42 |
| 44314.28125 | 31.29 |
| 44314.291666666664 | 31.24 |
| 44314.302083333336 | 30.92 |
| 44314.3125 | 30.7 |
| 44314.322916666664 | 30.4 |
| 44314.333333333336 | 30.24 |
| 44314.34375 | 30.21 |
| 44314.354166666664 | 30.2 |
| 44314.364583333336 | 30.32 |
| 44314.375 | 30.35 |
| 44314.385416666664 | 30.25 |
| 44314.395833333336 | 30.3 |
| 44314.40625 | 30.55 |
| 44314.416666666664 | 30.92 |
| 44314.427083333336 | 31.13 |
| 44314.4375 | 31.25 |
| 44314.447916666664 | 31.42 |
| 44314.458333333336 | 31.69 |
| 44314.46875 | 31.81 |
| 44314.479166666664 | 31.93 |
| 44314.489583333336 | 31.99 |
| 44314.5 | 32.02 |
| 44314.510416666664 | 32.06 |
| 44314.520833333336 | 32.09 |
| 44314.53125 | 32.11 |
| 44314.541666666664 | 32.13 |
| 44314.552083333336 | 32.16 |
| 44314.5625 | 32.2 |
| 44314.572916666664 | 32.24 |
| 44314.583333333336 | 32.26 |
| 44314.59375 | 32.29 |
| 44314.604166666664 | 32.29 |
| 44314.614583333336 | 32.22 |
| 44314.625 | 32.24 |
| 44314.635416666664 | 32.24 |
| 44314.645833333336 | 32.24 |
| 44314.65625 | 32.24 |
| 44314.666666666664 | 32.22 |
| 44314.677083333336 | 32.21 |
| 44314.6875 | 32.2 |
| 44314.697916666664 | 32.18 |
| 44314.708333333336 | 32.1 |
| 44314.71875 | 32.02 |
| 44314.729166666664 | 32.03 |
| 44314.739583333336 | 31.84 |
| 44314.75 | 31.74 |
| 44314.760416666664 | 31.43 |
| 44314.770833333336 | 31.43 |
| 44314.78125 | 31.04 |
| 44314.791666666664 | 30.73 |
| 44314.802083333336 | 30.48 |
| 44314.8125 | 30.25 |
| 44314.822916666664 | 30.26 |
| 44314.833333333336 | 30.27 |
| 44314.84375 | 30.3 |
| 44314.854166666664 | 30.19 |
| 44314.864583333336 | 30.28 |
| 44314.875 | 30.27 |
| 44314.885416666664 | 30.24 |
| 44314.895833333336 | 30.38 |
| 44314.90625 | 30.56 |
| 44314.916666666664 | 31.13 |
| 44314.927083333336 | 31.32 |
| 44314.9375 | 31.46 |
| 44314.947916666664 | 31.76 |
| 44314.958333333336 | 31.9 |
| 44314.96875 | 32.02 |
| 44314.979166666664 | 32.12 |
| 44314.989583333336 | 32.19 |
| 44315.0 | 32.25 |
| 44315.010416666664 | 32.26 |
| 44315.020833333336 | 32.27 |
| 44315.03125 | 32.25 |
| 44315.041666666664 | 32.25 |
| 44315.052083333336 | 32.28 |
| 44315.0625 | 32.31 |
| 44315.072916666664 | 32.34 |
| 44315.083333333336 | 32.36 |
| 44315.09375 | 32.36 |
| 44315.104166666664 | 32.33 |
| 44315.114583333336 | 32.32 |
| 44315.125 | 32.31 |
| 44315.135416666664 | 32.32 |
| 44315.145833333336 | 32.3 |
| 44315.15625 | 32.29 |
| 44315.166666666664 | 32.29 |
| 44315.177083333336 | 32.3 |
| 44315.1875 | 32.32 |
| 44315.197916666664 | 32.3 |
| 44315.208333333336 | 32.32 |
| 44315.21875 | 32.3 |
| 44315.229166666664 | 32.29 |
| 44315.239583333336 | 32.28 |
| 44315.25 | 32.24 |
| 44315.260416666664 | 32.25 |
| 44315.270833333336 | 32.22 |
| 44315.28125 | 32.17 |
| 44315.291666666664 | 32.05 |
| 44315.302083333336 | 31.85 |
| 44315.3125 | 31.7 |
| 44315.322916666664 | 31.55 |
| 44315.333333333336 | 31.35 |
| 44315.34375 | 31.12 |
| 44315.354166666664 | 30.89 |
| 44315.364583333336 | 30.65 |
| 44315.375 | 30.54 |
| 44315.385416666664 | 30.49 |
| 44315.395833333336 | 30.48 |
| 44315.40625 | 30.64 |
| 44315.416666666664 | 30.58 |
| 44315.427083333336 | 30.69 |
| 44315.4375 | 30.82 |
| 44315.447916666664 | 30.95 |
| 44315.458333333336 | 31.3 |
| 44315.46875 | 31.43 |
| 44315.479166666664 | 31.58 |
| 44315.489583333336 | 31.71 |
| 44315.5 | 31.81 |
| 44315.510416666664 | 31.92 |
| 44315.520833333336 | 32.05 |
| 44315.53125 | 32.14 |
| 44315.541666666664 | 32.2 |
| 44315.552083333336 | 32.21 |
| 44315.5625 | 32.24 |
| 44315.572916666664 | 32.25 |
| 44315.583333333336 | 32.26 |
| 44315.59375 | 32.32 |
| 44315.604166666664 | 32.28 |
| 44315.614583333336 | 32.3 |
| 44315.625 | 32.33 |
| 44315.635416666664 | 32.34 |
| 44315.645833333336 | 32.31 |
| 44315.65625 | 32.27 |
| 44315.666666666664 | 32.39 |
| 44315.677083333336 | 32.33 |
| 44315.6875 | 32.36 |
| 44315.697916666664 | 32.3 |
| 44315.708333333336 | 32.3 |
| 44315.71875 | 32.33 |
| 44315.729166666664 | 32.28 |
| 44315.739583333336 | 32.22 |
| 44315.75 | 32.23 |
| 44315.760416666664 | 32.2 |
| 44315.770833333336 | 32.06 |
| 44315.78125 | 31.98 |
| 44315.791666666664 | 31.81 |
| 44315.802083333336 | 31.67 |
| 44315.8125 | 31.55 |
| 44315.822916666664 | 31.46 |
| 44315.833333333336 | 31.36 |
| 44315.84375 | 31.26 |
| 44315.854166666664 | 31.15 |
| 44315.864583333336 | 31.05 |
| 44315.875 | 30.94 |
| 44315.885416666664 | 30.85 |
| 44315.895833333336 | 30.87 |
| 44315.90625 | 31.04 |
| 44315.916666666664 | 31.04 |
| 44315.927083333336 | 31.15 |
| 44315.9375 | 31.27 |
| 44315.947916666664 | 31.57 |
| 44315.958333333336 | 31.87 |
| 44315.96875 | 32 |
| 44315.979166666664 | 32.12 |
| 44315.989583333336 | 32.33 |
| 44316.0 | 32.46 |
| 44316.010416666664 | 32.57 |
| 44316.020833333336 | 32.59 |
| 44316.03125 | 32.59 |
| 44316.041666666664 | 32.55 |
| 44316.052083333336 | 32.53 |
| 44316.0625 | 32.5 |
| 44316.072916666664 | 32.49 |
| 44316.083333333336 | 32.5 |
| 44316.09375 | 32.53 |
| 44316.104166666664 | 32.56 |
| 44316.114583333336 | 32.57 |
| 44316.125 | 32.56 |
| 44316.135416666664 | 32.53 |
| 44316.145833333336 | 32.52 |
| 44316.15625 | 32.5 |
| 44316.166666666664 | 32.49 |
| 44316.177083333336 | 32.5 |
| 44316.1875 | 32.46 |
| 44316.197916666664 | 32.49 |
| 44316.208333333336 | 32.5 |
| 44316.21875 | 32.52 |
| 44316.229166666664 | 32.52 |
| 44316.239583333336 | 32.58 |
| 44316.25 | 32.56 |
| 44316.260416666664 | 32.56 |
| 44316.270833333336 | 32.57 |
| 44316.28125 | 32.57 |
| 44316.291666666664 | 32.52 |
| 44316.302083333336 | 32.48 |
| 44316.3125 | 32.41 |
| 44316.322916666664 | 32.38 |
| 44316.333333333336 | 32.28 |
| 44316.34375 | 32 |
| 44316.354166666664 | 31.8 |
| 44316.364583333336 | 31.69 |
| 44316.375 | 31.29 |
| 44316.385416666664 | 31.08 |
| 44316.395833333336 | 31.01 |
| 44316.40625 | 30.78 |
| 44316.416666666664 | 30.7 |
| 44316.427083333336 | 30.61 |
| 44316.4375 | 30.58 |
| 44316.447916666664 | 30.7 |
| 44316.458333333336 | 30.71 |
| 44316.46875 | 30.62 |
| 44316.479166666664 | 30.73 |
| 44316.489583333336 | 30.88 |
| 44316.5 | 31.23 |
| 44316.510416666664 | 31.52 |
| 44316.520833333336 | 31.74 |
| 44316.53125 | 31.85 |
| 44316.541666666664 | 31.9 |
| 44316.552083333336 | 31.93 |
| 44316.5625 | 31.99 |
| 44316.572916666664 | 32.09 |
| 44316.583333333336 | 32.17 |
| 44316.59375 | 32.22 |
| 44316.604166666664 | 32.27 |
| 44316.614583333336 | 32.3 |
| 44316.625 | 32.32 |
| 44316.635416666664 | 32.33 |
| 44316.645833333336 | 32.34 |
| 44316.65625 | 32.35 |
| 44316.666666666664 | 32.35 |
| 44316.677083333336 | 32.36 |
| 44316.6875 | 32.35 |
| 44316.697916666664 | 32.38 |
| 44316.708333333336 | 32.34 |
| 44316.71875 | 32.35 |
| 44316.729166666664 | 32.39 |
| 44316.739583333336 | 32.38 |
| 44316.75 | 32.32 |
| 44316.760416666664 | 32.38 |
| 44316.770833333336 | 32.32 |
| 44316.78125 | 32.32 |
| 44316.791666666664 | 32.3 |
| 44316.802083333336 | 32.19 |
| 44316.8125 | 32.12 |
| 44316.822916666664 | 32.05 |
| 44316.833333333336 | 31.79 |
| 44316.84375 | 31.76 |
| 44316.854166666664 | 31.53 |
| 44316.864583333336 | 31.46 |
| 44316.875 | 31.35 |
| 44316.885416666664 | 31.2 |
| 44316.895833333336 | 31.15 |
| 44316.90625 | 31.05 |
| 44316.916666666664 | 30.95 |
| 44316.927083333336 | 30.87 |
| 44316.9375 | 31 |
| 44316.947916666664 | 31.03 |
| 44316.958333333336 | 30.9 |
| 44316.96875 | 30.94 |
| 44316.979166666664 | 31.14 |
| 44316.989583333336 | 31.61 |
| 44317.0 | 31.8 |
| 44317.010416666664 | 31.97 |
| 44317.020833333336 | 32.06 |
| 44317.03125 | 32.08 |
| 44317.041666666664 | 32.07 |
| 44317.052083333336 | 32.08 |
| 44317.0625 | 32.11 |
| 44317.072916666664 | 32.14 |
| 44317.083333333336 | 32.26 |
| 44317.09375 | 32.33 |
| 44317.104166666664 | 32.41 |
| 44317.114583333336 | 32.35 |
| 44317.125 | 32.36 |
| 44317.135416666664 | 32.37 |
| 44317.145833333336 | 32.44 |
| 44317.15625 | 32.38 |